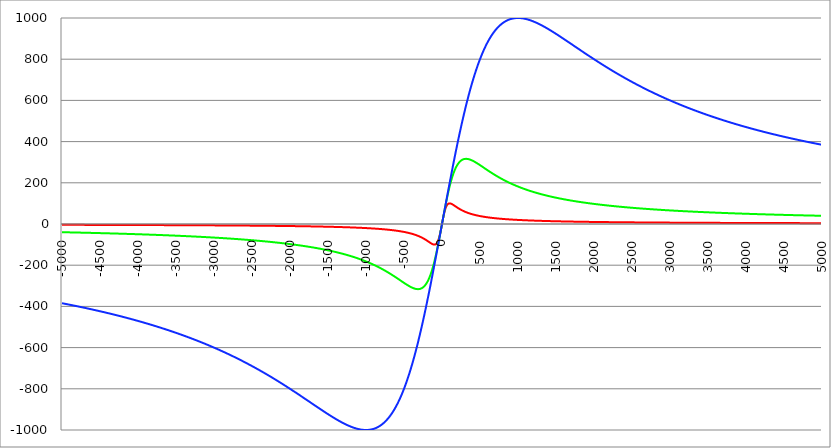
| Category | Series 1 | Series 0 | Series 2 |
|---|---|---|---|
| -5000.0 | -3.998 | -39.841 | -384.615 |
| -4995.0 | -4.002 | -39.88 | -384.971 |
| -4990.0 | -4.006 | -39.92 | -385.327 |
| -4985.0 | -4.01 | -39.96 | -385.683 |
| -4980.0 | -4.014 | -39.999 | -386.041 |
| -4975.0 | -4.018 | -40.039 | -386.398 |
| -4970.0 | -4.023 | -40.079 | -386.757 |
| -4965.0 | -4.027 | -40.119 | -387.116 |
| -4960.0 | -4.031 | -40.159 | -387.476 |
| -4955.0 | -4.035 | -40.2 | -387.836 |
| -4950.0 | -4.039 | -40.24 | -388.197 |
| -4945.0 | -4.043 | -40.28 | -388.559 |
| -4940.0 | -4.047 | -40.321 | -388.921 |
| -4935.0 | -4.051 | -40.361 | -389.284 |
| -4930.0 | -4.055 | -40.402 | -389.648 |
| -4925.0 | -4.059 | -40.442 | -390.012 |
| -4920.0 | -4.063 | -40.483 | -390.377 |
| -4915.0 | -4.067 | -40.524 | -390.743 |
| -4910.0 | -4.072 | -40.565 | -391.109 |
| -4905.0 | -4.076 | -40.606 | -391.476 |
| -4900.0 | -4.08 | -40.647 | -391.843 |
| -4895.0 | -4.084 | -40.688 | -392.211 |
| -4890.0 | -4.088 | -40.729 | -392.58 |
| -4885.0 | -4.092 | -40.771 | -392.95 |
| -4880.0 | -4.097 | -40.812 | -393.32 |
| -4875.0 | -4.101 | -40.854 | -393.691 |
| -4870.0 | -4.105 | -40.895 | -394.062 |
| -4865.0 | -4.109 | -40.937 | -394.435 |
| -4860.0 | -4.113 | -40.979 | -394.807 |
| -4855.0 | -4.118 | -41.021 | -395.181 |
| -4850.0 | -4.122 | -41.063 | -395.555 |
| -4845.0 | -4.126 | -41.105 | -395.93 |
| -4840.0 | -4.13 | -41.147 | -396.306 |
| -4835.0 | -4.135 | -41.189 | -396.682 |
| -4830.0 | -4.139 | -41.231 | -397.059 |
| -4825.0 | -4.143 | -41.273 | -397.436 |
| -4820.0 | -4.148 | -41.316 | -397.814 |
| -4815.0 | -4.152 | -41.358 | -398.193 |
| -4810.0 | -4.156 | -41.401 | -398.573 |
| -4805.0 | -4.161 | -41.444 | -398.953 |
| -4800.0 | -4.165 | -41.487 | -399.334 |
| -4795.0 | -4.169 | -41.529 | -399.716 |
| -4790.0 | -4.174 | -41.572 | -400.099 |
| -4785.0 | -4.178 | -41.616 | -400.482 |
| -4780.0 | -4.182 | -41.659 | -400.865 |
| -4775.0 | -4.187 | -41.702 | -401.25 |
| -4770.0 | -4.191 | -41.745 | -401.635 |
| -4765.0 | -4.195 | -41.789 | -402.021 |
| -4760.0 | -4.2 | -41.832 | -402.408 |
| -4755.0 | -4.204 | -41.876 | -402.795 |
| -4750.0 | -4.209 | -41.919 | -403.183 |
| -4745.0 | -4.213 | -41.963 | -403.572 |
| -4740.0 | -4.218 | -42.007 | -403.961 |
| -4735.0 | -4.222 | -42.051 | -404.351 |
| -4730.0 | -4.226 | -42.095 | -404.742 |
| -4725.0 | -4.231 | -42.139 | -405.134 |
| -4720.0 | -4.235 | -42.184 | -405.526 |
| -4715.0 | -4.24 | -42.228 | -405.919 |
| -4710.0 | -4.244 | -42.272 | -406.313 |
| -4705.0 | -4.249 | -42.317 | -406.707 |
| -4700.0 | -4.253 | -42.361 | -407.103 |
| -4695.0 | -4.258 | -42.406 | -407.499 |
| -4690.0 | -4.262 | -42.451 | -407.895 |
| -4685.0 | -4.267 | -42.496 | -408.293 |
| -4680.0 | -4.272 | -42.541 | -408.691 |
| -4675.0 | -4.276 | -42.586 | -409.09 |
| -4670.0 | -4.281 | -42.631 | -409.489 |
| -4665.0 | -4.285 | -42.676 | -409.89 |
| -4660.0 | -4.29 | -42.722 | -410.291 |
| -4655.0 | -4.294 | -42.767 | -410.693 |
| -4650.0 | -4.299 | -42.813 | -411.095 |
| -4645.0 | -4.304 | -42.858 | -411.498 |
| -4640.0 | -4.308 | -42.904 | -411.903 |
| -4635.0 | -4.313 | -42.95 | -412.307 |
| -4630.0 | -4.318 | -42.996 | -412.713 |
| -4625.0 | -4.322 | -43.042 | -413.119 |
| -4620.0 | -4.327 | -43.088 | -413.526 |
| -4615.0 | -4.332 | -43.134 | -413.934 |
| -4610.0 | -4.336 | -43.181 | -414.343 |
| -4605.0 | -4.341 | -43.227 | -414.752 |
| -4600.0 | -4.346 | -43.274 | -415.162 |
| -4595.0 | -4.35 | -43.32 | -415.573 |
| -4590.0 | -4.355 | -43.367 | -415.985 |
| -4585.0 | -4.36 | -43.414 | -416.398 |
| -4580.0 | -4.365 | -43.461 | -416.811 |
| -4575.0 | -4.369 | -43.508 | -417.225 |
| -4570.0 | -4.374 | -43.555 | -417.64 |
| -4565.0 | -4.379 | -43.602 | -418.055 |
| -4560.0 | -4.384 | -43.65 | -418.471 |
| -4555.0 | -4.389 | -43.697 | -418.889 |
| -4550.0 | -4.393 | -43.745 | -419.307 |
| -4545.0 | -4.398 | -43.792 | -419.725 |
| -4540.0 | -4.403 | -43.84 | -420.145 |
| -4535.0 | -4.408 | -43.888 | -420.565 |
| -4530.0 | -4.413 | -43.936 | -420.986 |
| -4525.0 | -4.418 | -43.984 | -421.408 |
| -4520.0 | -4.423 | -44.032 | -421.831 |
| -4515.0 | -4.428 | -44.081 | -422.254 |
| -4510.0 | -4.432 | -44.129 | -422.678 |
| -4505.0 | -4.437 | -44.177 | -423.104 |
| -4500.0 | -4.442 | -44.226 | -423.529 |
| -4495.0 | -4.447 | -44.275 | -423.956 |
| -4490.0 | -4.452 | -44.324 | -424.384 |
| -4485.0 | -4.457 | -44.372 | -424.812 |
| -4480.0 | -4.462 | -44.422 | -425.241 |
| -4475.0 | -4.467 | -44.471 | -425.671 |
| -4470.0 | -4.472 | -44.52 | -426.102 |
| -4465.0 | -4.477 | -44.569 | -426.533 |
| -4460.0 | -4.482 | -44.619 | -426.966 |
| -4455.0 | -4.487 | -44.668 | -427.399 |
| -4450.0 | -4.492 | -44.718 | -427.833 |
| -4445.0 | -4.497 | -44.768 | -428.268 |
| -4440.0 | -4.502 | -44.818 | -428.704 |
| -4435.0 | -4.507 | -44.868 | -429.14 |
| -4430.0 | -4.512 | -44.918 | -429.578 |
| -4425.0 | -4.517 | -44.968 | -430.016 |
| -4420.0 | -4.523 | -45.018 | -430.455 |
| -4415.0 | -4.528 | -45.069 | -430.895 |
| -4410.0 | -4.533 | -45.119 | -431.336 |
| -4405.0 | -4.538 | -45.17 | -431.778 |
| -4400.0 | -4.543 | -45.221 | -432.22 |
| -4395.0 | -4.548 | -45.272 | -432.663 |
| -4390.0 | -4.553 | -45.323 | -433.108 |
| -4385.0 | -4.559 | -45.374 | -433.553 |
| -4380.0 | -4.564 | -45.425 | -433.999 |
| -4375.0 | -4.569 | -45.477 | -434.445 |
| -4370.0 | -4.574 | -45.528 | -434.893 |
| -4365.0 | -4.579 | -45.58 | -435.341 |
| -4360.0 | -4.585 | -45.632 | -435.791 |
| -4355.0 | -4.59 | -45.683 | -436.241 |
| -4350.0 | -4.595 | -45.735 | -436.692 |
| -4345.0 | -4.601 | -45.787 | -437.144 |
| -4340.0 | -4.606 | -45.84 | -437.597 |
| -4335.0 | -4.611 | -45.892 | -438.051 |
| -4330.0 | -4.616 | -45.944 | -438.505 |
| -4325.0 | -4.622 | -45.997 | -438.961 |
| -4320.0 | -4.627 | -46.05 | -439.417 |
| -4315.0 | -4.633 | -46.102 | -439.875 |
| -4310.0 | -4.638 | -46.155 | -440.333 |
| -4305.0 | -4.643 | -46.208 | -440.792 |
| -4300.0 | -4.649 | -46.261 | -441.252 |
| -4295.0 | -4.654 | -46.315 | -441.713 |
| -4290.0 | -4.659 | -46.368 | -442.175 |
| -4285.0 | -4.665 | -46.422 | -442.637 |
| -4280.0 | -4.67 | -46.475 | -443.101 |
| -4275.0 | -4.676 | -46.529 | -443.565 |
| -4270.0 | -4.681 | -46.583 | -444.031 |
| -4265.0 | -4.687 | -46.637 | -444.497 |
| -4260.0 | -4.692 | -46.691 | -444.964 |
| -4255.0 | -4.698 | -46.745 | -445.433 |
| -4250.0 | -4.703 | -46.8 | -445.902 |
| -4245.0 | -4.709 | -46.854 | -446.372 |
| -4240.0 | -4.714 | -46.909 | -446.843 |
| -4235.0 | -4.72 | -46.964 | -447.314 |
| -4230.0 | -4.725 | -47.019 | -447.787 |
| -4225.0 | -4.731 | -47.074 | -448.261 |
| -4220.0 | -4.737 | -47.129 | -448.736 |
| -4215.0 | -4.742 | -47.184 | -449.211 |
| -4210.0 | -4.748 | -47.239 | -449.688 |
| -4205.0 | -4.754 | -47.295 | -450.165 |
| -4200.0 | -4.759 | -47.351 | -450.644 |
| -4195.0 | -4.765 | -47.406 | -451.123 |
| -4190.0 | -4.771 | -47.462 | -451.604 |
| -4185.0 | -4.776 | -47.518 | -452.085 |
| -4180.0 | -4.782 | -47.575 | -452.567 |
| -4175.0 | -4.788 | -47.631 | -453.05 |
| -4170.0 | -4.793 | -47.687 | -453.534 |
| -4165.0 | -4.799 | -47.744 | -454.02 |
| -4160.0 | -4.805 | -47.801 | -454.506 |
| -4155.0 | -4.811 | -47.858 | -454.993 |
| -4150.0 | -4.816 | -47.915 | -455.481 |
| -4145.0 | -4.822 | -47.972 | -455.97 |
| -4140.0 | -4.828 | -48.029 | -456.46 |
| -4135.0 | -4.834 | -48.086 | -456.951 |
| -4130.0 | -4.84 | -48.144 | -457.443 |
| -4125.0 | -4.846 | -48.202 | -457.936 |
| -4120.0 | -4.852 | -48.259 | -458.43 |
| -4115.0 | -4.857 | -48.317 | -458.925 |
| -4110.0 | -4.863 | -48.375 | -459.421 |
| -4105.0 | -4.869 | -48.434 | -459.918 |
| -4100.0 | -4.875 | -48.492 | -460.415 |
| -4095.0 | -4.881 | -48.551 | -460.914 |
| -4090.0 | -4.887 | -48.609 | -461.414 |
| -4085.0 | -4.893 | -48.668 | -461.915 |
| -4080.0 | -4.899 | -48.727 | -462.417 |
| -4075.0 | -4.905 | -48.786 | -462.92 |
| -4070.0 | -4.911 | -48.845 | -463.424 |
| -4065.0 | -4.917 | -48.905 | -463.929 |
| -4060.0 | -4.923 | -48.964 | -464.435 |
| -4055.0 | -4.929 | -49.024 | -464.942 |
| -4050.0 | -4.935 | -49.083 | -465.45 |
| -4045.0 | -4.941 | -49.143 | -465.959 |
| -4040.0 | -4.947 | -49.203 | -466.47 |
| -4035.0 | -4.954 | -49.264 | -466.981 |
| -4030.0 | -4.96 | -49.324 | -467.493 |
| -4025.0 | -4.966 | -49.385 | -468.006 |
| -4020.0 | -4.972 | -49.445 | -468.521 |
| -4015.0 | -4.978 | -49.506 | -469.036 |
| -4010.0 | -4.984 | -49.567 | -469.552 |
| -4005.0 | -4.991 | -49.628 | -470.07 |
| -4000.0 | -4.997 | -49.689 | -470.588 |
| -3995.0 | -5.003 | -49.751 | -471.108 |
| -3990.0 | -5.009 | -49.812 | -471.628 |
| -3985.0 | -5.016 | -49.874 | -472.15 |
| -3980.0 | -5.022 | -49.936 | -472.673 |
| -3975.0 | -5.028 | -49.998 | -473.197 |
| -3970.0 | -5.035 | -50.06 | -473.722 |
| -3965.0 | -5.041 | -50.123 | -474.248 |
| -3960.0 | -5.047 | -50.185 | -474.775 |
| -3955.0 | -5.054 | -50.248 | -475.303 |
| -3950.0 | -5.06 | -50.31 | -475.832 |
| -3945.0 | -5.066 | -50.373 | -476.362 |
| -3940.0 | -5.073 | -50.437 | -476.894 |
| -3935.0 | -5.079 | -50.5 | -477.426 |
| -3930.0 | -5.086 | -50.563 | -477.96 |
| -3925.0 | -5.092 | -50.627 | -478.494 |
| -3920.0 | -5.099 | -50.691 | -479.03 |
| -3915.0 | -5.105 | -50.754 | -479.567 |
| -3910.0 | -5.112 | -50.818 | -480.105 |
| -3905.0 | -5.118 | -50.883 | -480.644 |
| -3900.0 | -5.125 | -50.947 | -481.184 |
| -3895.0 | -5.131 | -51.012 | -481.726 |
| -3890.0 | -5.138 | -51.076 | -482.268 |
| -3885.0 | -5.145 | -51.141 | -482.812 |
| -3880.0 | -5.151 | -51.206 | -483.357 |
| -3875.0 | -5.158 | -51.271 | -483.902 |
| -3870.0 | -5.165 | -51.337 | -484.449 |
| -3865.0 | -5.171 | -51.402 | -484.998 |
| -3860.0 | -5.178 | -51.468 | -485.547 |
| -3855.0 | -5.185 | -51.534 | -486.097 |
| -3850.0 | -5.191 | -51.6 | -486.649 |
| -3845.0 | -5.198 | -51.666 | -487.201 |
| -3840.0 | -5.205 | -51.732 | -487.755 |
| -3835.0 | -5.212 | -51.799 | -488.31 |
| -3830.0 | -5.218 | -51.866 | -488.866 |
| -3825.0 | -5.225 | -51.933 | -489.424 |
| -3820.0 | -5.232 | -52 | -489.982 |
| -3815.0 | -5.239 | -52.067 | -490.542 |
| -3810.0 | -5.246 | -52.134 | -491.103 |
| -3805.0 | -5.253 | -52.202 | -491.665 |
| -3800.0 | -5.26 | -52.27 | -492.228 |
| -3795.0 | -5.266 | -52.338 | -492.792 |
| -3790.0 | -5.273 | -52.406 | -493.358 |
| -3785.0 | -5.28 | -52.474 | -493.925 |
| -3780.0 | -5.287 | -52.542 | -494.493 |
| -3775.0 | -5.294 | -52.611 | -495.062 |
| -3770.0 | -5.301 | -52.68 | -495.632 |
| -3765.0 | -5.308 | -52.749 | -496.204 |
| -3760.0 | -5.315 | -52.818 | -496.776 |
| -3755.0 | -5.322 | -52.887 | -497.35 |
| -3750.0 | -5.33 | -52.957 | -497.925 |
| -3745.0 | -5.337 | -53.026 | -498.502 |
| -3740.0 | -5.344 | -53.096 | -499.079 |
| -3735.0 | -5.351 | -53.166 | -499.658 |
| -3730.0 | -5.358 | -53.237 | -500.238 |
| -3725.0 | -5.365 | -53.307 | -500.819 |
| -3720.0 | -5.372 | -53.378 | -501.402 |
| -3715.0 | -5.38 | -53.449 | -501.985 |
| -3710.0 | -5.387 | -53.52 | -502.57 |
| -3705.0 | -5.394 | -53.591 | -503.157 |
| -3700.0 | -5.401 | -53.662 | -503.744 |
| -3695.0 | -5.409 | -53.734 | -504.333 |
| -3690.0 | -5.416 | -53.805 | -504.923 |
| -3685.0 | -5.423 | -53.877 | -505.514 |
| -3680.0 | -5.431 | -53.949 | -506.106 |
| -3675.0 | -5.438 | -54.022 | -506.7 |
| -3670.0 | -5.446 | -54.094 | -507.295 |
| -3665.0 | -5.453 | -54.167 | -507.891 |
| -3660.0 | -5.46 | -54.24 | -508.489 |
| -3655.0 | -5.468 | -54.313 | -509.087 |
| -3650.0 | -5.475 | -54.386 | -509.688 |
| -3645.0 | -5.483 | -54.46 | -510.289 |
| -3640.0 | -5.49 | -54.533 | -510.892 |
| -3635.0 | -5.498 | -54.607 | -511.495 |
| -3630.0 | -5.505 | -54.681 | -512.101 |
| -3625.0 | -5.513 | -54.756 | -512.707 |
| -3620.0 | -5.521 | -54.83 | -513.315 |
| -3615.0 | -5.528 | -54.905 | -513.924 |
| -3610.0 | -5.536 | -54.98 | -514.535 |
| -3605.0 | -5.544 | -55.055 | -515.146 |
| -3600.0 | -5.551 | -55.13 | -515.759 |
| -3595.0 | -5.559 | -55.206 | -516.374 |
| -3590.0 | -5.567 | -55.281 | -516.989 |
| -3585.0 | -5.574 | -55.357 | -517.606 |
| -3580.0 | -5.582 | -55.433 | -518.225 |
| -3575.0 | -5.59 | -55.51 | -518.844 |
| -3570.0 | -5.598 | -55.586 | -519.465 |
| -3565.0 | -5.606 | -55.663 | -520.088 |
| -3560.0 | -5.614 | -55.74 | -520.711 |
| -3555.0 | -5.621 | -55.817 | -521.336 |
| -3550.0 | -5.629 | -55.895 | -521.963 |
| -3545.0 | -5.637 | -55.972 | -522.591 |
| -3540.0 | -5.645 | -56.05 | -523.22 |
| -3535.0 | -5.653 | -56.128 | -523.85 |
| -3530.0 | -5.661 | -56.206 | -524.482 |
| -3525.0 | -5.669 | -56.285 | -525.115 |
| -3520.0 | -5.677 | -56.363 | -525.75 |
| -3515.0 | -5.685 | -56.442 | -526.386 |
| -3510.0 | -5.693 | -56.521 | -527.023 |
| -3505.0 | -5.701 | -56.601 | -527.662 |
| -3500.0 | -5.71 | -56.68 | -528.302 |
| -3495.0 | -5.718 | -56.76 | -528.943 |
| -3490.0 | -5.726 | -56.84 | -529.586 |
| -3485.0 | -5.734 | -56.92 | -530.231 |
| -3480.0 | -5.742 | -57.001 | -530.876 |
| -3475.0 | -5.751 | -57.081 | -531.523 |
| -3470.0 | -5.759 | -57.162 | -532.172 |
| -3465.0 | -5.767 | -57.243 | -532.822 |
| -3460.0 | -5.776 | -57.325 | -533.473 |
| -3455.0 | -5.784 | -57.406 | -534.126 |
| -3450.0 | -5.792 | -57.488 | -534.78 |
| -3445.0 | -5.801 | -57.57 | -535.436 |
| -3440.0 | -5.809 | -57.652 | -536.093 |
| -3435.0 | -5.817 | -57.735 | -536.751 |
| -3430.0 | -5.826 | -57.818 | -537.411 |
| -3425.0 | -5.834 | -57.901 | -538.073 |
| -3420.0 | -5.843 | -57.984 | -538.735 |
| -3415.0 | -5.851 | -58.067 | -539.4 |
| -3410.0 | -5.86 | -58.151 | -540.065 |
| -3405.0 | -5.869 | -58.235 | -540.733 |
| -3400.0 | -5.877 | -58.319 | -541.401 |
| -3395.0 | -5.886 | -58.403 | -542.071 |
| -3390.0 | -5.895 | -58.488 | -542.743 |
| -3385.0 | -5.903 | -58.573 | -543.416 |
| -3380.0 | -5.912 | -58.658 | -544.091 |
| -3375.0 | -5.921 | -58.744 | -544.767 |
| -3370.0 | -5.929 | -58.829 | -545.444 |
| -3365.0 | -5.938 | -58.915 | -546.123 |
| -3360.0 | -5.947 | -59.001 | -546.804 |
| -3355.0 | -5.956 | -59.088 | -547.486 |
| -3350.0 | -5.965 | -59.174 | -548.169 |
| -3345.0 | -5.974 | -59.261 | -548.854 |
| -3340.0 | -5.983 | -59.348 | -549.541 |
| -3335.0 | -5.992 | -59.436 | -550.229 |
| -3330.0 | -6.001 | -59.523 | -550.919 |
| -3325.0 | -6.01 | -59.611 | -551.61 |
| -3320.0 | -6.019 | -59.699 | -552.302 |
| -3315.0 | -6.028 | -59.788 | -552.997 |
| -3310.0 | -6.037 | -59.876 | -553.692 |
| -3305.0 | -6.046 | -59.965 | -554.39 |
| -3300.0 | -6.055 | -60.055 | -555.088 |
| -3295.0 | -6.064 | -60.144 | -555.789 |
| -3290.0 | -6.073 | -60.234 | -556.491 |
| -3285.0 | -6.083 | -60.324 | -557.194 |
| -3280.0 | -6.092 | -60.414 | -557.899 |
| -3275.0 | -6.101 | -60.505 | -558.606 |
| -3270.0 | -6.11 | -60.595 | -559.314 |
| -3265.0 | -6.12 | -60.686 | -560.023 |
| -3260.0 | -6.129 | -60.778 | -560.735 |
| -3255.0 | -6.139 | -60.869 | -561.448 |
| -3250.0 | -6.148 | -60.961 | -562.162 |
| -3245.0 | -6.157 | -61.053 | -562.878 |
| -3240.0 | -6.167 | -61.146 | -563.596 |
| -3235.0 | -6.176 | -61.239 | -564.315 |
| -3230.0 | -6.186 | -61.332 | -565.036 |
| -3225.0 | -6.196 | -61.425 | -565.758 |
| -3220.0 | -6.205 | -61.518 | -566.483 |
| -3215.0 | -6.215 | -61.612 | -567.208 |
| -3210.0 | -6.224 | -61.706 | -567.936 |
| -3205.0 | -6.234 | -61.801 | -568.664 |
| -3200.0 | -6.244 | -61.896 | -569.395 |
| -3195.0 | -6.254 | -61.991 | -570.127 |
| -3190.0 | -6.263 | -62.086 | -570.861 |
| -3185.0 | -6.273 | -62.181 | -571.596 |
| -3180.0 | -6.283 | -62.277 | -572.334 |
| -3175.0 | -6.293 | -62.373 | -573.072 |
| -3170.0 | -6.303 | -62.47 | -573.813 |
| -3165.0 | -6.313 | -62.567 | -574.555 |
| -3160.0 | -6.323 | -62.664 | -575.299 |
| -3155.0 | -6.333 | -62.761 | -576.044 |
| -3150.0 | -6.343 | -62.859 | -576.791 |
| -3145.0 | -6.353 | -62.957 | -577.54 |
| -3140.0 | -6.363 | -63.055 | -578.29 |
| -3135.0 | -6.373 | -63.153 | -579.042 |
| -3130.0 | -6.383 | -63.252 | -579.796 |
| -3125.0 | -6.393 | -63.351 | -580.552 |
| -3120.0 | -6.404 | -63.451 | -581.309 |
| -3115.0 | -6.414 | -63.551 | -582.068 |
| -3110.0 | -6.424 | -63.651 | -582.828 |
| -3105.0 | -6.435 | -63.751 | -583.59 |
| -3100.0 | -6.445 | -63.852 | -584.354 |
| -3095.0 | -6.455 | -63.953 | -585.12 |
| -3090.0 | -6.466 | -64.054 | -585.888 |
| -3085.0 | -6.476 | -64.156 | -586.657 |
| -3080.0 | -6.487 | -64.258 | -587.428 |
| -3075.0 | -6.497 | -64.36 | -588.2 |
| -3070.0 | -6.508 | -64.463 | -588.974 |
| -3065.0 | -6.518 | -64.566 | -589.751 |
| -3060.0 | -6.529 | -64.669 | -590.528 |
| -3055.0 | -6.54 | -64.772 | -591.308 |
| -3050.0 | -6.55 | -64.876 | -592.089 |
| -3045.0 | -6.561 | -64.981 | -592.872 |
| -3040.0 | -6.572 | -65.085 | -593.657 |
| -3035.0 | -6.583 | -65.19 | -594.444 |
| -3030.0 | -6.593 | -65.295 | -595.232 |
| -3025.0 | -6.604 | -65.401 | -596.022 |
| -3020.0 | -6.615 | -65.507 | -596.814 |
| -3015.0 | -6.626 | -65.613 | -597.608 |
| -3010.0 | -6.637 | -65.72 | -598.404 |
| -3005.0 | -6.648 | -65.827 | -599.201 |
| -3000.0 | -6.659 | -65.934 | -600 |
| -2995.0 | -6.67 | -66.042 | -600.801 |
| -2990.0 | -6.681 | -66.15 | -601.604 |
| -2985.0 | -6.693 | -66.258 | -602.408 |
| -2980.0 | -6.704 | -66.367 | -603.214 |
| -2975.0 | -6.715 | -66.476 | -604.023 |
| -2970.0 | -6.726 | -66.585 | -604.833 |
| -2965.0 | -6.738 | -66.695 | -605.644 |
| -2960.0 | -6.749 | -66.805 | -606.458 |
| -2955.0 | -6.76 | -66.916 | -607.273 |
| -2950.0 | -6.772 | -67.026 | -608.091 |
| -2945.0 | -6.783 | -67.138 | -608.91 |
| -2940.0 | -6.795 | -67.249 | -609.731 |
| -2935.0 | -6.806 | -67.361 | -610.554 |
| -2930.0 | -6.818 | -67.473 | -611.378 |
| -2925.0 | -6.83 | -67.586 | -612.205 |
| -2920.0 | -6.841 | -67.699 | -613.033 |
| -2915.0 | -6.853 | -67.813 | -613.864 |
| -2910.0 | -6.865 | -67.926 | -614.696 |
| -2905.0 | -6.877 | -68.041 | -615.53 |
| -2900.0 | -6.888 | -68.155 | -616.366 |
| -2895.0 | -6.9 | -68.27 | -617.203 |
| -2890.0 | -6.912 | -68.385 | -618.043 |
| -2885.0 | -6.924 | -68.501 | -618.885 |
| -2880.0 | -6.936 | -68.617 | -619.728 |
| -2875.0 | -6.948 | -68.734 | -620.573 |
| -2870.0 | -6.96 | -68.851 | -621.421 |
| -2865.0 | -6.972 | -68.968 | -622.27 |
| -2860.0 | -6.984 | -69.085 | -623.121 |
| -2855.0 | -6.997 | -69.204 | -623.974 |
| -2850.0 | -7.009 | -69.322 | -624.829 |
| -2845.0 | -7.021 | -69.441 | -625.686 |
| -2840.0 | -7.034 | -69.56 | -626.544 |
| -2835.0 | -7.046 | -69.68 | -627.405 |
| -2830.0 | -7.058 | -69.8 | -628.268 |
| -2825.0 | -7.071 | -69.92 | -629.132 |
| -2820.0 | -7.083 | -70.041 | -629.999 |
| -2815.0 | -7.096 | -70.163 | -630.867 |
| -2810.0 | -7.108 | -70.284 | -631.738 |
| -2805.0 | -7.121 | -70.406 | -632.61 |
| -2800.0 | -7.134 | -70.529 | -633.484 |
| -2795.0 | -7.146 | -70.652 | -634.36 |
| -2790.0 | -7.159 | -70.775 | -635.239 |
| -2785.0 | -7.172 | -70.899 | -636.119 |
| -2780.0 | -7.185 | -71.023 | -637.001 |
| -2775.0 | -7.198 | -71.148 | -637.885 |
| -2770.0 | -7.211 | -71.273 | -638.771 |
| -2765.0 | -7.224 | -71.399 | -639.659 |
| -2760.0 | -7.237 | -71.525 | -640.55 |
| -2755.0 | -7.25 | -71.651 | -641.442 |
| -2750.0 | -7.263 | -71.778 | -642.336 |
| -2745.0 | -7.276 | -71.905 | -643.232 |
| -2740.0 | -7.29 | -72.033 | -644.13 |
| -2735.0 | -7.303 | -72.161 | -645.03 |
| -2730.0 | -7.316 | -72.29 | -645.932 |
| -2725.0 | -7.33 | -72.419 | -646.836 |
| -2720.0 | -7.343 | -72.549 | -647.742 |
| -2715.0 | -7.357 | -72.679 | -648.651 |
| -2710.0 | -7.37 | -72.809 | -649.561 |
| -2705.0 | -7.384 | -72.94 | -650.473 |
| -2700.0 | -7.397 | -73.072 | -651.387 |
| -2695.0 | -7.411 | -73.204 | -652.303 |
| -2690.0 | -7.425 | -73.336 | -653.222 |
| -2685.0 | -7.438 | -73.469 | -654.142 |
| -2680.0 | -7.452 | -73.602 | -655.065 |
| -2675.0 | -7.466 | -73.736 | -655.989 |
| -2670.0 | -7.48 | -73.87 | -656.915 |
| -2665.0 | -7.494 | -74.005 | -657.844 |
| -2660.0 | -7.508 | -74.14 | -658.775 |
| -2655.0 | -7.522 | -74.276 | -659.707 |
| -2650.0 | -7.536 | -74.412 | -660.642 |
| -2645.0 | -7.551 | -74.549 | -661.579 |
| -2640.0 | -7.565 | -74.686 | -662.518 |
| -2635.0 | -7.579 | -74.824 | -663.458 |
| -2630.0 | -7.594 | -74.962 | -664.401 |
| -2625.0 | -7.608 | -75.101 | -665.347 |
| -2620.0 | -7.622 | -75.24 | -666.294 |
| -2615.0 | -7.637 | -75.38 | -667.243 |
| -2610.0 | -7.652 | -75.52 | -668.194 |
| -2605.0 | -7.666 | -75.66 | -669.148 |
| -2600.0 | -7.681 | -75.802 | -670.103 |
| -2595.0 | -7.696 | -75.944 | -671.061 |
| -2590.0 | -7.711 | -76.086 | -672.02 |
| -2585.0 | -7.725 | -76.229 | -672.982 |
| -2580.0 | -7.74 | -76.372 | -673.946 |
| -2575.0 | -7.755 | -76.516 | -674.912 |
| -2570.0 | -7.77 | -76.66 | -675.88 |
| -2565.0 | -7.785 | -76.805 | -676.85 |
| -2560.0 | -7.801 | -76.951 | -677.822 |
| -2555.0 | -7.816 | -77.097 | -678.797 |
| -2550.0 | -7.831 | -77.243 | -679.773 |
| -2545.0 | -7.846 | -77.391 | -680.752 |
| -2540.0 | -7.862 | -77.538 | -681.733 |
| -2535.0 | -7.877 | -77.687 | -682.716 |
| -2530.0 | -7.893 | -77.835 | -683.701 |
| -2525.0 | -7.908 | -77.985 | -684.688 |
| -2520.0 | -7.924 | -78.135 | -685.677 |
| -2515.0 | -7.94 | -78.285 | -686.668 |
| -2510.0 | -7.955 | -78.436 | -687.662 |
| -2505.0 | -7.971 | -78.588 | -688.657 |
| -2500.0 | -7.987 | -78.74 | -689.655 |
| -2495.0 | -8.003 | -78.893 | -690.655 |
| -2490.0 | -8.019 | -79.046 | -691.657 |
| -2485.0 | -8.035 | -79.2 | -692.661 |
| -2480.0 | -8.051 | -79.355 | -693.667 |
| -2475.0 | -8.068 | -79.51 | -694.676 |
| -2470.0 | -8.084 | -79.666 | -695.686 |
| -2465.0 | -8.1 | -79.822 | -696.699 |
| -2460.0 | -8.117 | -79.979 | -697.714 |
| -2455.0 | -8.133 | -80.137 | -698.731 |
| -2450.0 | -8.15 | -80.295 | -699.75 |
| -2445.0 | -8.166 | -80.454 | -700.771 |
| -2440.0 | -8.183 | -80.613 | -701.795 |
| -2435.0 | -8.2 | -80.773 | -702.82 |
| -2430.0 | -8.217 | -80.934 | -703.848 |
| -2425.0 | -8.233 | -81.095 | -704.878 |
| -2420.0 | -8.25 | -81.257 | -705.91 |
| -2415.0 | -8.267 | -81.42 | -706.944 |
| -2410.0 | -8.284 | -81.583 | -707.98 |
| -2405.0 | -8.302 | -81.747 | -709.019 |
| -2400.0 | -8.319 | -81.911 | -710.059 |
| -2395.0 | -8.336 | -82.076 | -711.102 |
| -2390.0 | -8.354 | -82.242 | -712.147 |
| -2385.0 | -8.371 | -82.409 | -713.194 |
| -2380.0 | -8.389 | -82.576 | -714.243 |
| -2375.0 | -8.406 | -82.744 | -715.294 |
| -2370.0 | -8.424 | -82.912 | -716.348 |
| -2365.0 | -8.442 | -83.081 | -717.403 |
| -2360.0 | -8.459 | -83.251 | -718.461 |
| -2355.0 | -8.477 | -83.422 | -719.521 |
| -2350.0 | -8.495 | -83.593 | -720.583 |
| -2345.0 | -8.513 | -83.765 | -721.647 |
| -2340.0 | -8.531 | -83.937 | -722.713 |
| -2335.0 | -8.55 | -84.11 | -723.781 |
| -2330.0 | -8.568 | -84.284 | -724.852 |
| -2325.0 | -8.586 | -84.459 | -725.924 |
| -2320.0 | -8.605 | -84.634 | -726.999 |
| -2315.0 | -8.623 | -84.811 | -728.076 |
| -2310.0 | -8.642 | -84.987 | -729.155 |
| -2305.0 | -8.66 | -85.165 | -730.236 |
| -2300.0 | -8.679 | -85.343 | -731.32 |
| -2295.0 | -8.698 | -85.522 | -732.405 |
| -2290.0 | -8.717 | -85.702 | -733.492 |
| -2285.0 | -8.736 | -85.882 | -734.582 |
| -2280.0 | -8.755 | -86.064 | -735.674 |
| -2275.0 | -8.774 | -86.246 | -736.768 |
| -2270.0 | -8.794 | -86.428 | -737.863 |
| -2265.0 | -8.813 | -86.612 | -738.961 |
| -2260.0 | -8.832 | -86.796 | -740.062 |
| -2255.0 | -8.852 | -86.981 | -741.164 |
| -2250.0 | -8.871 | -87.167 | -742.268 |
| -2245.0 | -8.891 | -87.354 | -743.374 |
| -2240.0 | -8.911 | -87.541 | -744.483 |
| -2235.0 | -8.931 | -87.729 | -745.593 |
| -2230.0 | -8.951 | -87.918 | -746.706 |
| -2225.0 | -8.971 | -88.108 | -747.821 |
| -2220.0 | -8.991 | -88.298 | -748.937 |
| -2215.0 | -9.011 | -88.49 | -750.056 |
| -2210.0 | -9.031 | -88.682 | -751.177 |
| -2205.0 | -9.052 | -88.875 | -752.3 |
| -2200.0 | -9.072 | -89.069 | -753.425 |
| -2195.0 | -9.093 | -89.263 | -754.552 |
| -2190.0 | -9.113 | -89.459 | -755.681 |
| -2185.0 | -9.134 | -89.655 | -756.812 |
| -2180.0 | -9.155 | -89.852 | -757.945 |
| -2175.0 | -9.176 | -90.05 | -759.08 |
| -2170.0 | -9.197 | -90.249 | -760.217 |
| -2165.0 | -9.218 | -90.449 | -761.355 |
| -2160.0 | -9.239 | -90.65 | -762.496 |
| -2155.0 | -9.261 | -90.851 | -763.639 |
| -2150.0 | -9.282 | -91.053 | -764.784 |
| -2145.0 | -9.304 | -91.257 | -765.931 |
| -2140.0 | -9.325 | -91.461 | -767.08 |
| -2135.0 | -9.347 | -91.666 | -768.231 |
| -2130.0 | -9.369 | -91.872 | -769.384 |
| -2125.0 | -9.391 | -92.079 | -770.538 |
| -2120.0 | -9.413 | -92.286 | -771.695 |
| -2115.0 | -9.435 | -92.495 | -772.853 |
| -2110.0 | -9.457 | -92.704 | -774.014 |
| -2105.0 | -9.48 | -92.915 | -775.176 |
| -2100.0 | -9.502 | -93.126 | -776.34 |
| -2095.0 | -9.525 | -93.339 | -777.506 |
| -2090.0 | -9.548 | -93.552 | -778.674 |
| -2085.0 | -9.57 | -93.766 | -779.844 |
| -2080.0 | -9.593 | -93.982 | -781.015 |
| -2075.0 | -9.616 | -94.198 | -782.189 |
| -2070.0 | -9.639 | -94.415 | -783.364 |
| -2065.0 | -9.663 | -94.633 | -784.541 |
| -2060.0 | -9.686 | -94.852 | -785.72 |
| -2055.0 | -9.709 | -95.072 | -786.9 |
| -2050.0 | -9.733 | -95.293 | -788.083 |
| -2045.0 | -9.757 | -95.516 | -789.267 |
| -2040.0 | -9.78 | -95.739 | -790.453 |
| -2035.0 | -9.804 | -95.963 | -791.64 |
| -2030.0 | -9.828 | -96.188 | -792.829 |
| -2025.0 | -9.853 | -96.414 | -794.02 |
| -2020.0 | -9.877 | -96.641 | -795.213 |
| -2015.0 | -9.901 | -96.87 | -796.407 |
| -2010.0 | -9.926 | -97.099 | -797.603 |
| -2005.0 | -9.95 | -97.33 | -798.801 |
| -2000.0 | -9.975 | -97.561 | -800 |
| -1995.0 | -10 | -97.794 | -801.201 |
| -1990.0 | -10.025 | -98.027 | -802.403 |
| -1985.0 | -10.05 | -98.262 | -803.607 |
| -1980.0 | -10.075 | -98.498 | -804.813 |
| -1975.0 | -10.101 | -98.735 | -806.02 |
| -1970.0 | -10.126 | -98.973 | -807.228 |
| -1965.0 | -10.152 | -99.212 | -808.438 |
| -1960.0 | -10.178 | -99.452 | -809.65 |
| -1955.0 | -10.203 | -99.693 | -810.863 |
| -1950.0 | -10.23 | -99.936 | -812.077 |
| -1945.0 | -10.256 | -100.18 | -813.293 |
| -1940.0 | -10.282 | -100.424 | -814.51 |
| -1935.0 | -10.308 | -100.67 | -815.729 |
| -1930.0 | -10.335 | -100.918 | -816.949 |
| -1925.0 | -10.362 | -101.166 | -818.17 |
| -1920.0 | -10.388 | -101.416 | -819.392 |
| -1915.0 | -10.415 | -101.666 | -820.616 |
| -1910.0 | -10.443 | -101.918 | -821.841 |
| -1905.0 | -10.47 | -102.171 | -823.067 |
| -1900.0 | -10.497 | -102.426 | -824.295 |
| -1895.0 | -10.525 | -102.682 | -825.524 |
| -1890.0 | -10.552 | -102.938 | -826.754 |
| -1885.0 | -10.58 | -103.196 | -827.985 |
| -1880.0 | -10.608 | -103.456 | -829.217 |
| -1875.0 | -10.636 | -103.717 | -830.45 |
| -1870.0 | -10.665 | -103.978 | -831.684 |
| -1865.0 | -10.693 | -104.242 | -832.919 |
| -1860.0 | -10.722 | -104.506 | -834.156 |
| -1855.0 | -10.75 | -104.772 | -835.393 |
| -1850.0 | -10.779 | -105.039 | -836.631 |
| -1845.0 | -10.808 | -105.307 | -837.87 |
| -1840.0 | -10.838 | -105.577 | -839.11 |
| -1835.0 | -10.867 | -105.848 | -840.351 |
| -1830.0 | -10.896 | -106.121 | -841.592 |
| -1825.0 | -10.926 | -106.395 | -842.834 |
| -1820.0 | -10.956 | -106.67 | -844.078 |
| -1815.0 | -10.986 | -106.946 | -845.321 |
| -1810.0 | -11.016 | -107.224 | -846.566 |
| -1805.0 | -11.046 | -107.504 | -847.811 |
| -1800.0 | -11.077 | -107.784 | -849.057 |
| -1795.0 | -11.108 | -108.067 | -850.303 |
| -1790.0 | -11.138 | -108.35 | -851.55 |
| -1785.0 | -11.169 | -108.635 | -852.797 |
| -1780.0 | -11.201 | -108.922 | -854.045 |
| -1775.0 | -11.232 | -109.21 | -855.293 |
| -1770.0 | -11.263 | -109.499 | -856.541 |
| -1765.0 | -11.295 | -109.79 | -857.79 |
| -1760.0 | -11.327 | -110.083 | -859.039 |
| -1755.0 | -11.359 | -110.376 | -860.289 |
| -1750.0 | -11.391 | -110.672 | -861.538 |
| -1745.0 | -11.424 | -110.969 | -862.788 |
| -1740.0 | -11.456 | -111.267 | -864.038 |
| -1735.0 | -11.489 | -111.567 | -865.288 |
| -1730.0 | -11.522 | -111.869 | -866.538 |
| -1725.0 | -11.555 | -112.172 | -867.788 |
| -1720.0 | -11.589 | -112.477 | -869.038 |
| -1715.0 | -11.622 | -112.784 | -870.288 |
| -1710.0 | -11.656 | -113.091 | -871.537 |
| -1705.0 | -11.69 | -113.401 | -872.787 |
| -1700.0 | -11.724 | -113.712 | -874.036 |
| -1695.0 | -11.758 | -114.025 | -875.285 |
| -1690.0 | -11.793 | -114.34 | -876.533 |
| -1685.0 | -11.828 | -114.656 | -877.781 |
| -1680.0 | -11.863 | -114.974 | -879.029 |
| -1675.0 | -11.898 | -115.294 | -880.276 |
| -1670.0 | -11.933 | -115.615 | -881.522 |
| -1665.0 | -11.969 | -115.938 | -882.768 |
| -1660.0 | -12.005 | -116.263 | -884.013 |
| -1655.0 | -12.041 | -116.589 | -885.258 |
| -1650.0 | -12.077 | -116.918 | -886.501 |
| -1645.0 | -12.113 | -117.248 | -887.744 |
| -1640.0 | -12.15 | -117.58 | -888.985 |
| -1635.0 | -12.187 | -117.913 | -890.226 |
| -1630.0 | -12.224 | -118.249 | -891.465 |
| -1625.0 | -12.261 | -118.586 | -892.704 |
| -1620.0 | -12.299 | -118.925 | -893.941 |
| -1615.0 | -12.337 | -119.266 | -895.177 |
| -1610.0 | -12.375 | -119.609 | -896.412 |
| -1605.0 | -12.413 | -119.954 | -897.645 |
| -1600.0 | -12.451 | -120.301 | -898.876 |
| -1595.0 | -12.49 | -120.649 | -900.107 |
| -1590.0 | -12.529 | -121 | -901.335 |
| -1585.0 | -12.568 | -121.352 | -902.562 |
| -1580.0 | -12.608 | -121.707 | -903.787 |
| -1575.0 | -12.647 | -122.063 | -905.01 |
| -1570.0 | -12.687 | -122.422 | -906.231 |
| -1565.0 | -12.728 | -122.782 | -907.45 |
| -1560.0 | -12.768 | -123.145 | -908.667 |
| -1555.0 | -12.809 | -123.509 | -909.882 |
| -1550.0 | -12.85 | -123.876 | -911.095 |
| -1545.0 | -12.891 | -124.245 | -912.305 |
| -1540.0 | -12.932 | -124.616 | -913.513 |
| -1535.0 | -12.974 | -124.989 | -914.718 |
| -1530.0 | -13.016 | -125.364 | -915.921 |
| -1525.0 | -13.059 | -125.741 | -917.121 |
| -1520.0 | -13.101 | -126.12 | -918.318 |
| -1515.0 | -13.144 | -126.502 | -919.512 |
| -1510.0 | -13.187 | -126.885 | -920.704 |
| -1505.0 | -13.231 | -127.271 | -921.892 |
| -1500.0 | -13.274 | -127.66 | -923.077 |
| -1495.0 | -13.318 | -128.05 | -924.259 |
| -1490.0 | -13.363 | -128.443 | -925.437 |
| -1485.0 | -13.407 | -128.838 | -926.612 |
| -1480.0 | -13.452 | -129.235 | -927.783 |
| -1475.0 | -13.497 | -129.635 | -928.951 |
| -1470.0 | -13.543 | -130.037 | -930.115 |
| -1465.0 | -13.589 | -130.441 | -931.275 |
| -1460.0 | -13.635 | -130.848 | -932.431 |
| -1455.0 | -13.681 | -131.257 | -933.583 |
| -1450.0 | -13.728 | -131.669 | -934.73 |
| -1445.0 | -13.775 | -132.083 | -935.873 |
| -1440.0 | -13.822 | -132.499 | -937.012 |
| -1435.0 | -13.87 | -132.918 | -938.146 |
| -1430.0 | -13.918 | -133.34 | -939.276 |
| -1425.0 | -13.966 | -133.764 | -940.4 |
| -1420.0 | -14.015 | -134.19 | -941.52 |
| -1415.0 | -14.064 | -134.619 | -942.634 |
| -1410.0 | -14.113 | -135.051 | -943.744 |
| -1405.0 | -14.163 | -135.485 | -944.847 |
| -1400.0 | -14.213 | -135.922 | -945.946 |
| -1395.0 | -14.264 | -136.362 | -947.039 |
| -1390.0 | -14.314 | -136.804 | -948.126 |
| -1385.0 | -14.366 | -137.249 | -949.207 |
| -1380.0 | -14.417 | -137.697 | -950.282 |
| -1375.0 | -14.469 | -138.148 | -951.351 |
| -1370.0 | -14.521 | -138.601 | -952.414 |
| -1365.0 | -14.574 | -139.057 | -953.47 |
| -1360.0 | -14.627 | -139.516 | -954.52 |
| -1355.0 | -14.68 | -139.978 | -955.563 |
| -1350.0 | -14.734 | -140.442 | -956.599 |
| -1345.0 | -14.788 | -140.91 | -957.628 |
| -1340.0 | -14.843 | -141.38 | -958.649 |
| -1335.0 | -14.898 | -141.853 | -959.664 |
| -1330.0 | -14.953 | -142.33 | -960.67 |
| -1325.0 | -15.009 | -142.809 | -961.669 |
| -1320.0 | -15.065 | -143.291 | -962.66 |
| -1315.0 | -15.122 | -143.777 | -963.644 |
| -1310.0 | -15.179 | -144.265 | -964.618 |
| -1305.0 | -15.236 | -144.757 | -965.585 |
| -1300.0 | -15.294 | -145.251 | -966.543 |
| -1295.0 | -15.352 | -145.749 | -967.492 |
| -1290.0 | -15.411 | -146.25 | -968.432 |
| -1285.0 | -15.471 | -146.754 | -969.363 |
| -1280.0 | -15.53 | -147.262 | -970.285 |
| -1275.0 | -15.59 | -147.773 | -971.197 |
| -1270.0 | -15.651 | -148.287 | -972.1 |
| -1265.0 | -15.712 | -148.804 | -972.993 |
| -1260.0 | -15.774 | -149.324 | -973.875 |
| -1255.0 | -15.836 | -149.849 | -974.748 |
| -1250.0 | -15.898 | -150.376 | -975.61 |
| -1245.0 | -15.961 | -150.907 | -976.461 |
| -1240.0 | -16.025 | -151.441 | -977.301 |
| -1235.0 | -16.089 | -151.979 | -978.131 |
| -1230.0 | -16.153 | -152.52 | -978.949 |
| -1225.0 | -16.218 | -153.065 | -979.755 |
| -1220.0 | -16.284 | -153.614 | -980.55 |
| -1215.0 | -16.35 | -154.166 | -981.332 |
| -1210.0 | -16.417 | -154.722 | -982.103 |
| -1205.0 | -16.484 | -155.281 | -982.861 |
| -1200.0 | -16.552 | -155.844 | -983.607 |
| -1195.0 | -16.62 | -156.411 | -984.339 |
| -1190.0 | -16.689 | -156.982 | -985.059 |
| -1185.0 | -16.758 | -157.556 | -985.765 |
| -1180.0 | -16.828 | -158.135 | -986.457 |
| -1175.0 | -16.899 | -158.717 | -987.136 |
| -1170.0 | -16.97 | -159.303 | -987.8 |
| -1165.0 | -17.042 | -159.893 | -988.45 |
| -1160.0 | -17.114 | -160.487 | -989.086 |
| -1155.0 | -17.187 | -161.085 | -989.707 |
| -1150.0 | -17.261 | -161.687 | -990.312 |
| -1145.0 | -17.335 | -162.293 | -990.902 |
| -1140.0 | -17.41 | -162.904 | -991.477 |
| -1135.0 | -17.485 | -163.518 | -992.035 |
| -1130.0 | -17.562 | -164.137 | -992.578 |
| -1125.0 | -17.638 | -164.76 | -993.103 |
| -1120.0 | -17.716 | -165.387 | -993.612 |
| -1115.0 | -17.794 | -166.018 | -994.104 |
| -1110.0 | -17.873 | -166.654 | -994.579 |
| -1105.0 | -17.953 | -167.294 | -995.036 |
| -1100.0 | -18.033 | -167.939 | -995.475 |
| -1095.0 | -18.114 | -168.588 | -995.896 |
| -1090.0 | -18.195 | -169.242 | -996.298 |
| -1085.0 | -18.278 | -169.9 | -996.682 |
| -1080.0 | -18.361 | -170.562 | -997.046 |
| -1075.0 | -18.445 | -171.229 | -997.391 |
| -1070.0 | -18.53 | -171.901 | -997.716 |
| -1065.0 | -18.615 | -172.578 | -998.02 |
| -1060.0 | -18.701 | -173.259 | -998.305 |
| -1055.0 | -18.789 | -173.945 | -998.568 |
| -1050.0 | -18.876 | -174.636 | -998.811 |
| -1045.0 | -18.965 | -175.332 | -999.032 |
| -1040.0 | -19.055 | -176.032 | -999.231 |
| -1035.0 | -19.145 | -176.738 | -999.409 |
| -1030.0 | -19.236 | -177.449 | -999.563 |
| -1025.0 | -19.328 | -178.164 | -999.695 |
| -1020.0 | -19.421 | -178.885 | -999.804 |
| -1015.0 | -19.515 | -179.61 | -999.889 |
| -1010.0 | -19.61 | -180.341 | -999.95 |
| -1005.0 | -19.705 | -181.077 | -999.988 |
| -1000.0 | -19.802 | -181.818 | -1000 |
| -995.0 | -19.9 | -182.565 | -999.987 |
| -990.0 | -19.998 | -183.316 | -999.949 |
| -985.0 | -20.097 | -184.073 | -999.886 |
| -980.0 | -20.198 | -184.836 | -999.796 |
| -975.0 | -20.299 | -185.604 | -999.68 |
| -970.0 | -20.402 | -186.377 | -999.536 |
| -965.0 | -20.505 | -187.156 | -999.366 |
| -960.0 | -20.61 | -187.94 | -999.167 |
| -955.0 | -20.715 | -188.731 | -998.941 |
| -950.0 | -20.822 | -189.526 | -998.686 |
| -945.0 | -20.93 | -190.328 | -998.402 |
| -940.0 | -21.038 | -191.135 | -998.089 |
| -935.0 | -21.148 | -191.947 | -997.746 |
| -930.0 | -21.26 | -192.766 | -997.373 |
| -925.0 | -21.372 | -193.591 | -996.969 |
| -920.0 | -21.485 | -194.421 | -996.534 |
| -915.0 | -21.6 | -195.257 | -996.067 |
| -910.0 | -21.716 | -196.1 | -995.569 |
| -905.0 | -21.833 | -196.948 | -995.039 |
| -900.0 | -21.951 | -197.802 | -994.475 |
| -895.0 | -22.071 | -198.663 | -993.878 |
| -890.0 | -22.192 | -199.529 | -993.248 |
| -885.0 | -22.314 | -200.402 | -992.584 |
| -880.0 | -22.438 | -201.281 | -991.885 |
| -875.0 | -22.562 | -202.166 | -991.15 |
| -870.0 | -22.689 | -203.058 | -990.381 |
| -865.0 | -22.816 | -203.955 | -989.575 |
| -860.0 | -22.946 | -204.859 | -988.733 |
| -855.0 | -23.076 | -205.77 | -987.854 |
| -850.0 | -23.208 | -206.687 | -986.938 |
| -845.0 | -23.342 | -207.61 | -985.983 |
| -840.0 | -23.477 | -208.54 | -984.991 |
| -835.0 | -23.613 | -209.477 | -983.959 |
| -830.0 | -23.752 | -210.42 | -982.888 |
| -825.0 | -23.891 | -211.369 | -981.778 |
| -820.0 | -24.033 | -212.325 | -980.627 |
| -815.0 | -24.176 | -213.288 | -979.435 |
| -810.0 | -24.321 | -214.257 | -978.202 |
| -805.0 | -24.467 | -215.233 | -976.927 |
| -800.0 | -24.615 | -216.216 | -975.61 |
| -795.0 | -24.765 | -217.206 | -974.25 |
| -790.0 | -24.917 | -218.202 | -972.846 |
| -785.0 | -25.071 | -219.205 | -971.399 |
| -780.0 | -25.226 | -220.215 | -969.908 |
| -775.0 | -25.384 | -221.231 | -968.372 |
| -770.0 | -25.543 | -222.254 | -966.79 |
| -765.0 | -25.705 | -223.284 | -965.163 |
| -760.0 | -25.868 | -224.321 | -963.489 |
| -755.0 | -26.033 | -225.365 | -961.768 |
| -750.0 | -26.201 | -226.415 | -960 |
| -745.0 | -26.371 | -227.472 | -958.184 |
| -740.0 | -26.542 | -228.536 | -956.319 |
| -735.0 | -26.716 | -229.607 | -954.406 |
| -730.0 | -26.893 | -230.684 | -952.443 |
| -725.0 | -27.071 | -231.768 | -950.43 |
| -720.0 | -27.252 | -232.859 | -948.367 |
| -715.0 | -27.435 | -233.956 | -946.252 |
| -710.0 | -27.621 | -235.06 | -944.086 |
| -705.0 | -27.809 | -236.171 | -941.868 |
| -700.0 | -28 | -237.288 | -939.597 |
| -695.0 | -28.193 | -238.412 | -937.273 |
| -690.0 | -28.389 | -239.542 | -934.896 |
| -685.0 | -28.588 | -240.678 | -932.464 |
| -680.0 | -28.789 | -241.821 | -929.978 |
| -675.0 | -28.993 | -242.97 | -927.437 |
| -670.0 | -29.2 | -244.125 | -924.84 |
| -665.0 | -29.41 | -245.286 | -922.186 |
| -660.0 | -29.623 | -246.453 | -919.476 |
| -655.0 | -29.839 | -247.625 | -916.709 |
| -650.0 | -30.058 | -248.804 | -913.884 |
| -645.0 | -30.28 | -249.988 | -911.001 |
| -640.0 | -30.505 | -251.177 | -908.059 |
| -635.0 | -30.734 | -252.372 | -905.058 |
| -630.0 | -30.966 | -253.572 | -901.997 |
| -625.0 | -31.201 | -254.777 | -898.876 |
| -620.0 | -31.44 | -255.987 | -895.695 |
| -615.0 | -31.683 | -257.201 | -892.452 |
| -610.0 | -31.929 | -258.42 | -889.148 |
| -605.0 | -32.179 | -259.643 | -885.782 |
| -600.0 | -32.432 | -260.87 | -882.353 |
| -595.0 | -32.69 | -262.1 | -878.861 |
| -590.0 | -32.952 | -263.334 | -875.306 |
| -585.0 | -33.217 | -264.571 | -871.687 |
| -580.0 | -33.487 | -265.811 | -868.004 |
| -575.0 | -33.761 | -267.054 | -864.256 |
| -570.0 | -34.04 | -268.298 | -860.442 |
| -565.0 | -34.323 | -269.545 | -856.564 |
| -560.0 | -34.611 | -270.793 | -852.619 |
| -555.0 | -34.903 | -272.042 | -848.608 |
| -550.0 | -35.2 | -273.292 | -844.53 |
| -545.0 | -35.502 | -274.542 | -840.385 |
| -540.0 | -35.809 | -275.792 | -836.172 |
| -535.0 | -36.121 | -277.041 | -831.892 |
| -530.0 | -36.439 | -278.288 | -827.543 |
| -525.0 | -36.761 | -279.534 | -823.126 |
| -520.0 | -37.09 | -280.778 | -818.64 |
| -515.0 | -37.424 | -282.018 | -814.084 |
| -510.0 | -37.764 | -283.255 | -809.46 |
| -505.0 | -38.11 | -284.487 | -804.765 |
| -500.0 | -38.462 | -285.714 | -800 |
| -495.0 | -38.82 | -286.936 | -795.165 |
| -490.0 | -39.184 | -288.151 | -790.259 |
| -485.0 | -39.556 | -289.358 | -785.282 |
| -480.0 | -39.933 | -290.557 | -780.234 |
| -475.0 | -40.318 | -291.747 | -775.115 |
| -470.0 | -40.71 | -292.926 | -769.924 |
| -465.0 | -41.11 | -294.094 | -764.661 |
| -460.0 | -41.516 | -295.25 | -759.327 |
| -455.0 | -41.931 | -296.393 | -753.92 |
| -450.0 | -42.353 | -297.521 | -748.441 |
| -445.0 | -42.783 | -298.633 | -742.889 |
| -440.0 | -43.222 | -299.728 | -737.265 |
| -435.0 | -43.669 | -300.804 | -731.569 |
| -430.0 | -44.125 | -301.86 | -725.8 |
| -425.0 | -44.59 | -302.895 | -719.958 |
| -420.0 | -45.064 | -303.907 | -714.043 |
| -415.0 | -45.548 | -304.895 | -708.055 |
| -410.0 | -46.042 | -305.856 | -701.995 |
| -405.0 | -46.545 | -306.789 | -695.861 |
| -400.0 | -47.059 | -307.692 | -689.655 |
| -395.0 | -47.583 | -308.564 | -683.376 |
| -390.0 | -48.118 | -309.401 | -677.025 |
| -385.0 | -48.665 | -310.202 | -670.6 |
| -380.0 | -49.223 | -310.966 | -664.103 |
| -375.0 | -49.793 | -311.688 | -657.534 |
| -370.0 | -50.374 | -312.368 | -650.893 |
| -365.0 | -50.969 | -313.002 | -644.179 |
| -360.0 | -51.576 | -313.589 | -637.394 |
| -355.0 | -52.196 | -314.125 | -630.537 |
| -350.0 | -52.83 | -314.607 | -623.608 |
| -345.0 | -53.478 | -315.033 | -616.608 |
| -340.0 | -54.14 | -315.399 | -609.537 |
| -335.0 | -54.817 | -315.703 | -602.396 |
| -330.0 | -55.509 | -315.941 | -595.184 |
| -325.0 | -56.216 | -316.109 | -587.903 |
| -320.0 | -56.94 | -316.206 | -580.552 |
| -315.0 | -57.679 | -316.225 | -573.131 |
| -310.0 | -58.435 | -316.165 | -565.642 |
| -305.0 | -59.209 | -316.021 | -558.084 |
| -300.0 | -60 | -315.789 | -550.459 |
| -295.0 | -60.809 | -315.466 | -542.766 |
| -290.0 | -61.637 | -315.046 | -535.006 |
| -285.0 | -62.483 | -314.526 | -527.18 |
| -280.0 | -63.348 | -313.901 | -519.288 |
| -275.0 | -64.234 | -313.167 | -511.331 |
| -270.0 | -65.139 | -312.319 | -503.309 |
| -265.0 | -66.064 | -311.353 | -495.223 |
| -260.0 | -67.01 | -310.263 | -487.074 |
| -255.0 | -67.977 | -309.044 | -478.862 |
| -250.0 | -68.966 | -307.692 | -470.588 |
| -245.0 | -69.975 | -306.202 | -462.253 |
| -240.0 | -71.006 | -304.569 | -453.858 |
| -235.0 | -72.058 | -302.786 | -445.403 |
| -230.0 | -73.132 | -300.85 | -436.889 |
| -225.0 | -74.227 | -298.755 | -428.316 |
| -220.0 | -75.342 | -296.496 | -419.687 |
| -215.0 | -76.478 | -294.067 | -411.001 |
| -210.0 | -77.634 | -291.464 | -402.26 |
| -205.0 | -78.808 | -288.682 | -393.465 |
| -200.0 | -80 | -285.714 | -384.615 |
| -195.0 | -81.208 | -282.558 | -375.713 |
| -190.0 | -82.43 | -279.206 | -366.76 |
| -185.0 | -83.663 | -275.657 | -357.756 |
| -180.0 | -84.906 | -271.903 | -348.702 |
| -175.0 | -86.154 | -267.943 | -339.6 |
| -170.0 | -87.404 | -263.77 | -330.45 |
| -165.0 | -88.65 | -259.383 | -321.254 |
| -160.0 | -89.888 | -254.777 | -312.012 |
| -155.0 | -91.109 | -249.95 | -302.727 |
| -150.0 | -92.308 | -244.898 | -293.399 |
| -145.0 | -93.473 | -239.62 | -284.028 |
| -140.0 | -94.595 | -234.114 | -274.617 |
| -135.0 | -95.66 | -228.378 | -265.167 |
| -130.0 | -96.654 | -222.412 | -255.679 |
| -125.0 | -97.561 | -216.216 | -246.154 |
| -120.0 | -98.361 | -209.79 | -236.593 |
| -115.0 | -99.031 | -203.135 | -226.998 |
| -110.0 | -99.548 | -196.253 | -217.37 |
| -105.0 | -99.881 | -189.147 | -207.71 |
| -100.0 | -100 | -181.818 | -198.02 |
| -95.0 | -99.869 | -174.272 | -188.301 |
| -90.0 | -99.448 | -166.512 | -178.554 |
| -85.0 | -98.694 | -158.545 | -168.781 |
| -80.0 | -97.561 | -150.376 | -158.983 |
| -75.0 | -96 | -142.012 | -149.161 |
| -70.0 | -93.96 | -133.46 | -139.317 |
| -65.0 | -91.388 | -124.73 | -129.453 |
| -60.0 | -88.235 | -115.83 | -119.57 |
| -55.0 | -84.453 | -106.77 | -109.668 |
| -50.0 | -80 | -97.561 | -99.751 |
| -45.0 | -74.844 | -88.214 | -89.818 |
| -40.0 | -68.966 | -78.74 | -79.872 |
| -35.0 | -62.361 | -69.153 | -69.914 |
| -30.0 | -55.046 | -59.465 | -59.946 |
| -25.0 | -47.059 | -49.689 | -49.969 |
| -20.0 | -38.462 | -39.841 | -39.984 |
| -15.0 | -29.34 | -29.933 | -29.993 |
| -10.0 | -19.802 | -19.98 | -19.998 |
| -5.0 | -9.975 | -9.998 | -10 |
| 0.0 | 0 | 0 | 0 |
| 5.0 | 9.975 | 9.998 | 10 |
| 10.0 | 19.802 | 19.98 | 19.998 |
| 15.0 | 29.34 | 29.933 | 29.993 |
| 20.0 | 38.462 | 39.841 | 39.984 |
| 25.0 | 47.059 | 49.689 | 49.969 |
| 30.0 | 55.046 | 59.465 | 59.946 |
| 35.0 | 62.361 | 69.153 | 69.914 |
| 40.0 | 68.966 | 78.74 | 79.872 |
| 45.0 | 74.844 | 88.214 | 89.818 |
| 50.0 | 80 | 97.561 | 99.751 |
| 55.0 | 84.453 | 106.77 | 109.668 |
| 60.0 | 88.235 | 115.83 | 119.57 |
| 65.0 | 91.388 | 124.73 | 129.453 |
| 70.0 | 93.96 | 133.46 | 139.317 |
| 75.0 | 96 | 142.012 | 149.161 |
| 80.0 | 97.561 | 150.376 | 158.983 |
| 85.0 | 98.694 | 158.545 | 168.781 |
| 90.0 | 99.448 | 166.512 | 178.554 |
| 95.0 | 99.869 | 174.272 | 188.301 |
| 100.0 | 100 | 181.818 | 198.02 |
| 105.0 | 99.881 | 189.147 | 207.71 |
| 110.0 | 99.548 | 196.253 | 217.37 |
| 115.0 | 99.031 | 203.135 | 226.998 |
| 120.0 | 98.361 | 209.79 | 236.593 |
| 125.0 | 97.561 | 216.216 | 246.154 |
| 130.0 | 96.654 | 222.412 | 255.679 |
| 135.0 | 95.66 | 228.378 | 265.167 |
| 140.0 | 94.595 | 234.114 | 274.617 |
| 145.0 | 93.473 | 239.62 | 284.028 |
| 150.0 | 92.308 | 244.898 | 293.399 |
| 155.0 | 91.109 | 249.95 | 302.727 |
| 160.0 | 89.888 | 254.777 | 312.012 |
| 165.0 | 88.65 | 259.383 | 321.254 |
| 170.0 | 87.404 | 263.77 | 330.45 |
| 175.0 | 86.154 | 267.943 | 339.6 |
| 180.0 | 84.906 | 271.903 | 348.702 |
| 185.0 | 83.663 | 275.657 | 357.756 |
| 190.0 | 82.43 | 279.206 | 366.76 |
| 195.0 | 81.208 | 282.558 | 375.713 |
| 200.0 | 80 | 285.714 | 384.615 |
| 205.0 | 78.808 | 288.682 | 393.465 |
| 210.0 | 77.634 | 291.464 | 402.26 |
| 215.0 | 76.478 | 294.067 | 411.001 |
| 220.0 | 75.342 | 296.496 | 419.687 |
| 225.0 | 74.227 | 298.755 | 428.316 |
| 230.0 | 73.132 | 300.85 | 436.889 |
| 235.0 | 72.058 | 302.786 | 445.403 |
| 240.0 | 71.006 | 304.569 | 453.858 |
| 245.0 | 69.975 | 306.202 | 462.253 |
| 250.0 | 68.966 | 307.692 | 470.588 |
| 255.0 | 67.977 | 309.044 | 478.862 |
| 260.0 | 67.01 | 310.263 | 487.074 |
| 265.0 | 66.064 | 311.353 | 495.223 |
| 270.0 | 65.139 | 312.319 | 503.309 |
| 275.0 | 64.234 | 313.167 | 511.331 |
| 280.0 | 63.348 | 313.901 | 519.288 |
| 285.0 | 62.483 | 314.526 | 527.18 |
| 290.0 | 61.637 | 315.046 | 535.006 |
| 295.0 | 60.809 | 315.466 | 542.766 |
| 300.0 | 60 | 315.789 | 550.459 |
| 305.0 | 59.209 | 316.021 | 558.084 |
| 310.0 | 58.435 | 316.165 | 565.642 |
| 315.0 | 57.679 | 316.225 | 573.131 |
| 320.0 | 56.94 | 316.206 | 580.552 |
| 325.0 | 56.216 | 316.109 | 587.903 |
| 330.0 | 55.509 | 315.941 | 595.184 |
| 335.0 | 54.817 | 315.703 | 602.396 |
| 340.0 | 54.14 | 315.399 | 609.537 |
| 345.0 | 53.478 | 315.033 | 616.608 |
| 350.0 | 52.83 | 314.607 | 623.608 |
| 355.0 | 52.196 | 314.125 | 630.537 |
| 360.0 | 51.576 | 313.589 | 637.394 |
| 365.0 | 50.969 | 313.002 | 644.179 |
| 370.0 | 50.374 | 312.368 | 650.893 |
| 375.0 | 49.793 | 311.688 | 657.534 |
| 380.0 | 49.223 | 310.966 | 664.103 |
| 385.0 | 48.665 | 310.202 | 670.6 |
| 390.0 | 48.118 | 309.401 | 677.025 |
| 395.0 | 47.583 | 308.564 | 683.376 |
| 400.0 | 47.059 | 307.692 | 689.655 |
| 405.0 | 46.545 | 306.789 | 695.861 |
| 410.0 | 46.042 | 305.856 | 701.995 |
| 415.0 | 45.548 | 304.895 | 708.055 |
| 420.0 | 45.064 | 303.907 | 714.043 |
| 425.0 | 44.59 | 302.895 | 719.958 |
| 430.0 | 44.125 | 301.86 | 725.8 |
| 435.0 | 43.669 | 300.804 | 731.569 |
| 440.0 | 43.222 | 299.728 | 737.265 |
| 445.0 | 42.783 | 298.633 | 742.889 |
| 450.0 | 42.353 | 297.521 | 748.441 |
| 455.0 | 41.931 | 296.393 | 753.92 |
| 460.0 | 41.516 | 295.25 | 759.327 |
| 465.0 | 41.11 | 294.094 | 764.661 |
| 470.0 | 40.71 | 292.926 | 769.924 |
| 475.0 | 40.318 | 291.747 | 775.115 |
| 480.0 | 39.933 | 290.557 | 780.234 |
| 485.0 | 39.556 | 289.358 | 785.282 |
| 490.0 | 39.184 | 288.151 | 790.259 |
| 495.0 | 38.82 | 286.936 | 795.165 |
| 500.0 | 38.462 | 285.714 | 800 |
| 505.0 | 38.11 | 284.487 | 804.765 |
| 510.0 | 37.764 | 283.255 | 809.46 |
| 515.0 | 37.424 | 282.018 | 814.084 |
| 520.0 | 37.09 | 280.778 | 818.64 |
| 525.0 | 36.761 | 279.534 | 823.126 |
| 530.0 | 36.439 | 278.288 | 827.543 |
| 535.0 | 36.121 | 277.041 | 831.892 |
| 540.0 | 35.809 | 275.792 | 836.172 |
| 545.0 | 35.502 | 274.542 | 840.385 |
| 550.0 | 35.2 | 273.292 | 844.53 |
| 555.0 | 34.903 | 272.042 | 848.608 |
| 560.0 | 34.611 | 270.793 | 852.619 |
| 565.0 | 34.323 | 269.545 | 856.564 |
| 570.0 | 34.04 | 268.298 | 860.442 |
| 575.0 | 33.761 | 267.054 | 864.256 |
| 580.0 | 33.487 | 265.811 | 868.004 |
| 585.0 | 33.217 | 264.571 | 871.687 |
| 590.0 | 32.952 | 263.334 | 875.306 |
| 595.0 | 32.69 | 262.1 | 878.861 |
| 600.0 | 32.432 | 260.87 | 882.353 |
| 605.0 | 32.179 | 259.643 | 885.782 |
| 610.0 | 31.929 | 258.42 | 889.148 |
| 615.0 | 31.683 | 257.201 | 892.452 |
| 620.0 | 31.44 | 255.987 | 895.695 |
| 625.0 | 31.201 | 254.777 | 898.876 |
| 630.0 | 30.966 | 253.572 | 901.997 |
| 635.0 | 30.734 | 252.372 | 905.058 |
| 640.0 | 30.505 | 251.177 | 908.059 |
| 645.0 | 30.28 | 249.988 | 911.001 |
| 650.0 | 30.058 | 248.804 | 913.884 |
| 655.0 | 29.839 | 247.625 | 916.709 |
| 660.0 | 29.623 | 246.453 | 919.476 |
| 665.0 | 29.41 | 245.286 | 922.186 |
| 670.0 | 29.2 | 244.125 | 924.84 |
| 675.0 | 28.993 | 242.97 | 927.437 |
| 680.0 | 28.789 | 241.821 | 929.978 |
| 685.0 | 28.588 | 240.678 | 932.464 |
| 690.0 | 28.389 | 239.542 | 934.896 |
| 695.0 | 28.193 | 238.412 | 937.273 |
| 700.0 | 28 | 237.288 | 939.597 |
| 705.0 | 27.809 | 236.171 | 941.868 |
| 710.0 | 27.621 | 235.06 | 944.086 |
| 715.0 | 27.435 | 233.956 | 946.252 |
| 720.0 | 27.252 | 232.859 | 948.367 |
| 725.0 | 27.071 | 231.768 | 950.43 |
| 730.0 | 26.893 | 230.684 | 952.443 |
| 735.0 | 26.716 | 229.607 | 954.406 |
| 740.0 | 26.542 | 228.536 | 956.319 |
| 745.0 | 26.371 | 227.472 | 958.184 |
| 750.0 | 26.201 | 226.415 | 960 |
| 755.0 | 26.033 | 225.365 | 961.768 |
| 760.0 | 25.868 | 224.321 | 963.489 |
| 765.0 | 25.705 | 223.284 | 965.163 |
| 770.0 | 25.543 | 222.254 | 966.79 |
| 775.0 | 25.384 | 221.231 | 968.372 |
| 780.0 | 25.226 | 220.215 | 969.908 |
| 785.0 | 25.071 | 219.205 | 971.399 |
| 790.0 | 24.917 | 218.202 | 972.846 |
| 795.0 | 24.765 | 217.206 | 974.25 |
| 800.0 | 24.615 | 216.216 | 975.61 |
| 805.0 | 24.467 | 215.233 | 976.927 |
| 810.0 | 24.321 | 214.257 | 978.202 |
| 815.0 | 24.176 | 213.288 | 979.435 |
| 820.0 | 24.033 | 212.325 | 980.627 |
| 825.0 | 23.891 | 211.369 | 981.778 |
| 830.0 | 23.752 | 210.42 | 982.888 |
| 835.0 | 23.613 | 209.477 | 983.959 |
| 840.0 | 23.477 | 208.54 | 984.991 |
| 845.0 | 23.342 | 207.61 | 985.983 |
| 850.0 | 23.208 | 206.687 | 986.938 |
| 855.0 | 23.076 | 205.77 | 987.854 |
| 860.0 | 22.946 | 204.859 | 988.733 |
| 865.0 | 22.816 | 203.955 | 989.575 |
| 870.0 | 22.689 | 203.058 | 990.381 |
| 875.0 | 22.562 | 202.166 | 991.15 |
| 880.0 | 22.438 | 201.281 | 991.885 |
| 885.0 | 22.314 | 200.402 | 992.584 |
| 890.0 | 22.192 | 199.529 | 993.248 |
| 895.0 | 22.071 | 198.663 | 993.878 |
| 900.0 | 21.951 | 197.802 | 994.475 |
| 905.0 | 21.833 | 196.948 | 995.039 |
| 910.0 | 21.716 | 196.1 | 995.569 |
| 915.0 | 21.6 | 195.257 | 996.067 |
| 920.0 | 21.485 | 194.421 | 996.534 |
| 925.0 | 21.372 | 193.591 | 996.969 |
| 930.0 | 21.26 | 192.766 | 997.373 |
| 935.0 | 21.148 | 191.947 | 997.746 |
| 940.0 | 21.038 | 191.135 | 998.089 |
| 945.0 | 20.93 | 190.328 | 998.402 |
| 950.0 | 20.822 | 189.526 | 998.686 |
| 955.0 | 20.715 | 188.731 | 998.941 |
| 960.0 | 20.61 | 187.94 | 999.167 |
| 965.0 | 20.505 | 187.156 | 999.366 |
| 970.0 | 20.402 | 186.377 | 999.536 |
| 975.0 | 20.299 | 185.604 | 999.68 |
| 980.0 | 20.198 | 184.836 | 999.796 |
| 985.0 | 20.097 | 184.073 | 999.886 |
| 990.0 | 19.998 | 183.316 | 999.949 |
| 995.0 | 19.9 | 182.565 | 999.987 |
| 1000.0 | 19.802 | 181.818 | 1000 |
| 1005.0 | 19.705 | 181.077 | 999.988 |
| 1010.0 | 19.61 | 180.341 | 999.95 |
| 1015.0 | 19.515 | 179.61 | 999.889 |
| 1020.0 | 19.421 | 178.885 | 999.804 |
| 1025.0 | 19.328 | 178.164 | 999.695 |
| 1030.0 | 19.236 | 177.449 | 999.563 |
| 1035.0 | 19.145 | 176.738 | 999.409 |
| 1040.0 | 19.055 | 176.032 | 999.231 |
| 1045.0 | 18.965 | 175.332 | 999.032 |
| 1050.0 | 18.876 | 174.636 | 998.811 |
| 1055.0 | 18.789 | 173.945 | 998.568 |
| 1060.0 | 18.701 | 173.259 | 998.305 |
| 1065.0 | 18.615 | 172.578 | 998.02 |
| 1070.0 | 18.53 | 171.901 | 997.716 |
| 1075.0 | 18.445 | 171.229 | 997.391 |
| 1080.0 | 18.361 | 170.562 | 997.046 |
| 1085.0 | 18.278 | 169.9 | 996.682 |
| 1090.0 | 18.195 | 169.242 | 996.298 |
| 1095.0 | 18.114 | 168.588 | 995.896 |
| 1100.0 | 18.033 | 167.939 | 995.475 |
| 1105.0 | 17.953 | 167.294 | 995.036 |
| 1110.0 | 17.873 | 166.654 | 994.579 |
| 1115.0 | 17.794 | 166.018 | 994.104 |
| 1120.0 | 17.716 | 165.387 | 993.612 |
| 1125.0 | 17.638 | 164.76 | 993.103 |
| 1130.0 | 17.562 | 164.137 | 992.578 |
| 1135.0 | 17.485 | 163.518 | 992.035 |
| 1140.0 | 17.41 | 162.904 | 991.477 |
| 1145.0 | 17.335 | 162.293 | 990.902 |
| 1150.0 | 17.261 | 161.687 | 990.312 |
| 1155.0 | 17.187 | 161.085 | 989.707 |
| 1160.0 | 17.114 | 160.487 | 989.086 |
| 1165.0 | 17.042 | 159.893 | 988.45 |
| 1170.0 | 16.97 | 159.303 | 987.8 |
| 1175.0 | 16.899 | 158.717 | 987.136 |
| 1180.0 | 16.828 | 158.135 | 986.457 |
| 1185.0 | 16.758 | 157.556 | 985.765 |
| 1190.0 | 16.689 | 156.982 | 985.059 |
| 1195.0 | 16.62 | 156.411 | 984.339 |
| 1200.0 | 16.552 | 155.844 | 983.607 |
| 1205.0 | 16.484 | 155.281 | 982.861 |
| 1210.0 | 16.417 | 154.722 | 982.103 |
| 1215.0 | 16.35 | 154.166 | 981.332 |
| 1220.0 | 16.284 | 153.614 | 980.55 |
| 1225.0 | 16.218 | 153.065 | 979.755 |
| 1230.0 | 16.153 | 152.52 | 978.949 |
| 1235.0 | 16.089 | 151.979 | 978.131 |
| 1240.0 | 16.025 | 151.441 | 977.301 |
| 1245.0 | 15.961 | 150.907 | 976.461 |
| 1250.0 | 15.898 | 150.376 | 975.61 |
| 1255.0 | 15.836 | 149.849 | 974.748 |
| 1260.0 | 15.774 | 149.324 | 973.875 |
| 1265.0 | 15.712 | 148.804 | 972.993 |
| 1270.0 | 15.651 | 148.287 | 972.1 |
| 1275.0 | 15.59 | 147.773 | 971.197 |
| 1280.0 | 15.53 | 147.262 | 970.285 |
| 1285.0 | 15.471 | 146.754 | 969.363 |
| 1290.0 | 15.411 | 146.25 | 968.432 |
| 1295.0 | 15.352 | 145.749 | 967.492 |
| 1300.0 | 15.294 | 145.251 | 966.543 |
| 1305.0 | 15.236 | 144.757 | 965.585 |
| 1310.0 | 15.179 | 144.265 | 964.618 |
| 1315.0 | 15.122 | 143.777 | 963.644 |
| 1320.0 | 15.065 | 143.291 | 962.66 |
| 1325.0 | 15.009 | 142.809 | 961.669 |
| 1330.0 | 14.953 | 142.33 | 960.67 |
| 1335.0 | 14.898 | 141.853 | 959.664 |
| 1340.0 | 14.843 | 141.38 | 958.649 |
| 1345.0 | 14.788 | 140.91 | 957.628 |
| 1350.0 | 14.734 | 140.442 | 956.599 |
| 1355.0 | 14.68 | 139.978 | 955.563 |
| 1360.0 | 14.627 | 139.516 | 954.52 |
| 1365.0 | 14.574 | 139.057 | 953.47 |
| 1370.0 | 14.521 | 138.601 | 952.414 |
| 1375.0 | 14.469 | 138.148 | 951.351 |
| 1380.0 | 14.417 | 137.697 | 950.282 |
| 1385.0 | 14.366 | 137.249 | 949.207 |
| 1390.0 | 14.314 | 136.804 | 948.126 |
| 1395.0 | 14.264 | 136.362 | 947.039 |
| 1400.0 | 14.213 | 135.922 | 945.946 |
| 1405.0 | 14.163 | 135.485 | 944.847 |
| 1410.0 | 14.113 | 135.051 | 943.744 |
| 1415.0 | 14.064 | 134.619 | 942.634 |
| 1420.0 | 14.015 | 134.19 | 941.52 |
| 1425.0 | 13.966 | 133.764 | 940.4 |
| 1430.0 | 13.918 | 133.34 | 939.276 |
| 1435.0 | 13.87 | 132.918 | 938.146 |
| 1440.0 | 13.822 | 132.499 | 937.012 |
| 1445.0 | 13.775 | 132.083 | 935.873 |
| 1450.0 | 13.728 | 131.669 | 934.73 |
| 1455.0 | 13.681 | 131.257 | 933.583 |
| 1460.0 | 13.635 | 130.848 | 932.431 |
| 1465.0 | 13.589 | 130.441 | 931.275 |
| 1470.0 | 13.543 | 130.037 | 930.115 |
| 1475.0 | 13.497 | 129.635 | 928.951 |
| 1480.0 | 13.452 | 129.235 | 927.783 |
| 1485.0 | 13.407 | 128.838 | 926.612 |
| 1490.0 | 13.363 | 128.443 | 925.437 |
| 1495.0 | 13.318 | 128.05 | 924.259 |
| 1500.0 | 13.274 | 127.66 | 923.077 |
| 1505.0 | 13.231 | 127.271 | 921.892 |
| 1510.0 | 13.187 | 126.885 | 920.704 |
| 1515.0 | 13.144 | 126.502 | 919.512 |
| 1520.0 | 13.101 | 126.12 | 918.318 |
| 1525.0 | 13.059 | 125.741 | 917.121 |
| 1530.0 | 13.016 | 125.364 | 915.921 |
| 1535.0 | 12.974 | 124.989 | 914.718 |
| 1540.0 | 12.932 | 124.616 | 913.513 |
| 1545.0 | 12.891 | 124.245 | 912.305 |
| 1550.0 | 12.85 | 123.876 | 911.095 |
| 1555.0 | 12.809 | 123.509 | 909.882 |
| 1560.0 | 12.768 | 123.145 | 908.667 |
| 1565.0 | 12.728 | 122.782 | 907.45 |
| 1570.0 | 12.687 | 122.422 | 906.231 |
| 1575.0 | 12.647 | 122.063 | 905.01 |
| 1580.0 | 12.608 | 121.707 | 903.787 |
| 1585.0 | 12.568 | 121.352 | 902.562 |
| 1590.0 | 12.529 | 121 | 901.335 |
| 1595.0 | 12.49 | 120.649 | 900.107 |
| 1600.0 | 12.451 | 120.301 | 898.876 |
| 1605.0 | 12.413 | 119.954 | 897.645 |
| 1610.0 | 12.375 | 119.609 | 896.412 |
| 1615.0 | 12.337 | 119.266 | 895.177 |
| 1620.0 | 12.299 | 118.925 | 893.941 |
| 1625.0 | 12.261 | 118.586 | 892.704 |
| 1630.0 | 12.224 | 118.249 | 891.465 |
| 1635.0 | 12.187 | 117.913 | 890.226 |
| 1640.0 | 12.15 | 117.58 | 888.985 |
| 1645.0 | 12.113 | 117.248 | 887.744 |
| 1650.0 | 12.077 | 116.918 | 886.501 |
| 1655.0 | 12.041 | 116.589 | 885.258 |
| 1660.0 | 12.005 | 116.263 | 884.013 |
| 1665.0 | 11.969 | 115.938 | 882.768 |
| 1670.0 | 11.933 | 115.615 | 881.522 |
| 1675.0 | 11.898 | 115.294 | 880.276 |
| 1680.0 | 11.863 | 114.974 | 879.029 |
| 1685.0 | 11.828 | 114.656 | 877.781 |
| 1690.0 | 11.793 | 114.34 | 876.533 |
| 1695.0 | 11.758 | 114.025 | 875.285 |
| 1700.0 | 11.724 | 113.712 | 874.036 |
| 1705.0 | 11.69 | 113.401 | 872.787 |
| 1710.0 | 11.656 | 113.091 | 871.537 |
| 1715.0 | 11.622 | 112.784 | 870.288 |
| 1720.0 | 11.589 | 112.477 | 869.038 |
| 1725.0 | 11.555 | 112.172 | 867.788 |
| 1730.0 | 11.522 | 111.869 | 866.538 |
| 1735.0 | 11.489 | 111.567 | 865.288 |
| 1740.0 | 11.456 | 111.267 | 864.038 |
| 1745.0 | 11.424 | 110.969 | 862.788 |
| 1750.0 | 11.391 | 110.672 | 861.538 |
| 1755.0 | 11.359 | 110.376 | 860.289 |
| 1760.0 | 11.327 | 110.083 | 859.039 |
| 1765.0 | 11.295 | 109.79 | 857.79 |
| 1770.0 | 11.263 | 109.499 | 856.541 |
| 1775.0 | 11.232 | 109.21 | 855.293 |
| 1780.0 | 11.201 | 108.922 | 854.045 |
| 1785.0 | 11.169 | 108.635 | 852.797 |
| 1790.0 | 11.138 | 108.35 | 851.55 |
| 1795.0 | 11.108 | 108.067 | 850.303 |
| 1800.0 | 11.077 | 107.784 | 849.057 |
| 1805.0 | 11.046 | 107.504 | 847.811 |
| 1810.0 | 11.016 | 107.224 | 846.566 |
| 1815.0 | 10.986 | 106.946 | 845.321 |
| 1820.0 | 10.956 | 106.67 | 844.078 |
| 1825.0 | 10.926 | 106.395 | 842.834 |
| 1830.0 | 10.896 | 106.121 | 841.592 |
| 1835.0 | 10.867 | 105.848 | 840.351 |
| 1840.0 | 10.838 | 105.577 | 839.11 |
| 1845.0 | 10.808 | 105.307 | 837.87 |
| 1850.0 | 10.779 | 105.039 | 836.631 |
| 1855.0 | 10.75 | 104.772 | 835.393 |
| 1860.0 | 10.722 | 104.506 | 834.156 |
| 1865.0 | 10.693 | 104.242 | 832.919 |
| 1870.0 | 10.665 | 103.978 | 831.684 |
| 1875.0 | 10.636 | 103.717 | 830.45 |
| 1880.0 | 10.608 | 103.456 | 829.217 |
| 1885.0 | 10.58 | 103.196 | 827.985 |
| 1890.0 | 10.552 | 102.938 | 826.754 |
| 1895.0 | 10.525 | 102.682 | 825.524 |
| 1900.0 | 10.497 | 102.426 | 824.295 |
| 1905.0 | 10.47 | 102.171 | 823.067 |
| 1910.0 | 10.443 | 101.918 | 821.841 |
| 1915.0 | 10.415 | 101.666 | 820.616 |
| 1920.0 | 10.388 | 101.416 | 819.392 |
| 1925.0 | 10.362 | 101.166 | 818.17 |
| 1930.0 | 10.335 | 100.918 | 816.949 |
| 1935.0 | 10.308 | 100.67 | 815.729 |
| 1940.0 | 10.282 | 100.424 | 814.51 |
| 1945.0 | 10.256 | 100.18 | 813.293 |
| 1950.0 | 10.23 | 99.936 | 812.077 |
| 1955.0 | 10.203 | 99.693 | 810.863 |
| 1960.0 | 10.178 | 99.452 | 809.65 |
| 1965.0 | 10.152 | 99.212 | 808.438 |
| 1970.0 | 10.126 | 98.973 | 807.228 |
| 1975.0 | 10.101 | 98.735 | 806.02 |
| 1980.0 | 10.075 | 98.498 | 804.813 |
| 1985.0 | 10.05 | 98.262 | 803.607 |
| 1990.0 | 10.025 | 98.027 | 802.403 |
| 1995.0 | 10 | 97.794 | 801.201 |
| 2000.0 | 9.975 | 97.561 | 800 |
| 2005.0 | 9.95 | 97.33 | 798.801 |
| 2010.0 | 9.926 | 97.099 | 797.603 |
| 2015.0 | 9.901 | 96.87 | 796.407 |
| 2020.0 | 9.877 | 96.641 | 795.213 |
| 2025.0 | 9.853 | 96.414 | 794.02 |
| 2030.0 | 9.828 | 96.188 | 792.829 |
| 2035.0 | 9.804 | 95.963 | 791.64 |
| 2040.0 | 9.78 | 95.739 | 790.453 |
| 2045.0 | 9.757 | 95.516 | 789.267 |
| 2050.0 | 9.733 | 95.293 | 788.083 |
| 2055.0 | 9.709 | 95.072 | 786.9 |
| 2060.0 | 9.686 | 94.852 | 785.72 |
| 2065.0 | 9.663 | 94.633 | 784.541 |
| 2070.0 | 9.639 | 94.415 | 783.364 |
| 2075.0 | 9.616 | 94.198 | 782.189 |
| 2080.0 | 9.593 | 93.982 | 781.015 |
| 2085.0 | 9.57 | 93.766 | 779.844 |
| 2090.0 | 9.548 | 93.552 | 778.674 |
| 2095.0 | 9.525 | 93.339 | 777.506 |
| 2100.0 | 9.502 | 93.126 | 776.34 |
| 2105.0 | 9.48 | 92.915 | 775.176 |
| 2110.0 | 9.457 | 92.704 | 774.014 |
| 2115.0 | 9.435 | 92.495 | 772.853 |
| 2120.0 | 9.413 | 92.286 | 771.695 |
| 2125.0 | 9.391 | 92.079 | 770.538 |
| 2130.0 | 9.369 | 91.872 | 769.384 |
| 2135.0 | 9.347 | 91.666 | 768.231 |
| 2140.0 | 9.325 | 91.461 | 767.08 |
| 2145.0 | 9.304 | 91.257 | 765.931 |
| 2150.0 | 9.282 | 91.053 | 764.784 |
| 2155.0 | 9.261 | 90.851 | 763.639 |
| 2160.0 | 9.239 | 90.65 | 762.496 |
| 2165.0 | 9.218 | 90.449 | 761.355 |
| 2170.0 | 9.197 | 90.249 | 760.217 |
| 2175.0 | 9.176 | 90.05 | 759.08 |
| 2180.0 | 9.155 | 89.852 | 757.945 |
| 2185.0 | 9.134 | 89.655 | 756.812 |
| 2190.0 | 9.113 | 89.459 | 755.681 |
| 2195.0 | 9.093 | 89.263 | 754.552 |
| 2200.0 | 9.072 | 89.069 | 753.425 |
| 2205.0 | 9.052 | 88.875 | 752.3 |
| 2210.0 | 9.031 | 88.682 | 751.177 |
| 2215.0 | 9.011 | 88.49 | 750.056 |
| 2220.0 | 8.991 | 88.298 | 748.937 |
| 2225.0 | 8.971 | 88.108 | 747.821 |
| 2230.0 | 8.951 | 87.918 | 746.706 |
| 2235.0 | 8.931 | 87.729 | 745.593 |
| 2240.0 | 8.911 | 87.541 | 744.483 |
| 2245.0 | 8.891 | 87.354 | 743.374 |
| 2250.0 | 8.871 | 87.167 | 742.268 |
| 2255.0 | 8.852 | 86.981 | 741.164 |
| 2260.0 | 8.832 | 86.796 | 740.062 |
| 2265.0 | 8.813 | 86.612 | 738.961 |
| 2270.0 | 8.794 | 86.428 | 737.863 |
| 2275.0 | 8.774 | 86.246 | 736.768 |
| 2280.0 | 8.755 | 86.064 | 735.674 |
| 2285.0 | 8.736 | 85.882 | 734.582 |
| 2290.0 | 8.717 | 85.702 | 733.492 |
| 2295.0 | 8.698 | 85.522 | 732.405 |
| 2300.0 | 8.679 | 85.343 | 731.32 |
| 2305.0 | 8.66 | 85.165 | 730.236 |
| 2310.0 | 8.642 | 84.987 | 729.155 |
| 2315.0 | 8.623 | 84.811 | 728.076 |
| 2320.0 | 8.605 | 84.634 | 726.999 |
| 2325.0 | 8.586 | 84.459 | 725.924 |
| 2330.0 | 8.568 | 84.284 | 724.852 |
| 2335.0 | 8.55 | 84.11 | 723.781 |
| 2340.0 | 8.531 | 83.937 | 722.713 |
| 2345.0 | 8.513 | 83.765 | 721.647 |
| 2350.0 | 8.495 | 83.593 | 720.583 |
| 2355.0 | 8.477 | 83.422 | 719.521 |
| 2360.0 | 8.459 | 83.251 | 718.461 |
| 2365.0 | 8.442 | 83.081 | 717.403 |
| 2370.0 | 8.424 | 82.912 | 716.348 |
| 2375.0 | 8.406 | 82.744 | 715.294 |
| 2380.0 | 8.389 | 82.576 | 714.243 |
| 2385.0 | 8.371 | 82.409 | 713.194 |
| 2390.0 | 8.354 | 82.242 | 712.147 |
| 2395.0 | 8.336 | 82.076 | 711.102 |
| 2400.0 | 8.319 | 81.911 | 710.059 |
| 2405.0 | 8.302 | 81.747 | 709.019 |
| 2410.0 | 8.284 | 81.583 | 707.98 |
| 2415.0 | 8.267 | 81.42 | 706.944 |
| 2420.0 | 8.25 | 81.257 | 705.91 |
| 2425.0 | 8.233 | 81.095 | 704.878 |
| 2430.0 | 8.217 | 80.934 | 703.848 |
| 2435.0 | 8.2 | 80.773 | 702.82 |
| 2440.0 | 8.183 | 80.613 | 701.795 |
| 2445.0 | 8.166 | 80.454 | 700.771 |
| 2450.0 | 8.15 | 80.295 | 699.75 |
| 2455.0 | 8.133 | 80.137 | 698.731 |
| 2460.0 | 8.117 | 79.979 | 697.714 |
| 2465.0 | 8.1 | 79.822 | 696.699 |
| 2470.0 | 8.084 | 79.666 | 695.686 |
| 2475.0 | 8.068 | 79.51 | 694.676 |
| 2480.0 | 8.051 | 79.355 | 693.667 |
| 2485.0 | 8.035 | 79.2 | 692.661 |
| 2490.0 | 8.019 | 79.046 | 691.657 |
| 2495.0 | 8.003 | 78.893 | 690.655 |
| 2500.0 | 7.987 | 78.74 | 689.655 |
| 2505.0 | 7.971 | 78.588 | 688.657 |
| 2510.0 | 7.955 | 78.436 | 687.662 |
| 2515.0 | 7.94 | 78.285 | 686.668 |
| 2520.0 | 7.924 | 78.135 | 685.677 |
| 2525.0 | 7.908 | 77.985 | 684.688 |
| 2530.0 | 7.893 | 77.835 | 683.701 |
| 2535.0 | 7.877 | 77.687 | 682.716 |
| 2540.0 | 7.862 | 77.538 | 681.733 |
| 2545.0 | 7.846 | 77.391 | 680.752 |
| 2550.0 | 7.831 | 77.243 | 679.773 |
| 2555.0 | 7.816 | 77.097 | 678.797 |
| 2560.0 | 7.801 | 76.951 | 677.822 |
| 2565.0 | 7.785 | 76.805 | 676.85 |
| 2570.0 | 7.77 | 76.66 | 675.88 |
| 2575.0 | 7.755 | 76.516 | 674.912 |
| 2580.0 | 7.74 | 76.372 | 673.946 |
| 2585.0 | 7.725 | 76.229 | 672.982 |
| 2590.0 | 7.711 | 76.086 | 672.02 |
| 2595.0 | 7.696 | 75.944 | 671.061 |
| 2600.0 | 7.681 | 75.802 | 670.103 |
| 2605.0 | 7.666 | 75.66 | 669.148 |
| 2610.0 | 7.652 | 75.52 | 668.194 |
| 2615.0 | 7.637 | 75.38 | 667.243 |
| 2620.0 | 7.622 | 75.24 | 666.294 |
| 2625.0 | 7.608 | 75.101 | 665.347 |
| 2630.0 | 7.594 | 74.962 | 664.401 |
| 2635.0 | 7.579 | 74.824 | 663.458 |
| 2640.0 | 7.565 | 74.686 | 662.518 |
| 2645.0 | 7.551 | 74.549 | 661.579 |
| 2650.0 | 7.536 | 74.412 | 660.642 |
| 2655.0 | 7.522 | 74.276 | 659.707 |
| 2660.0 | 7.508 | 74.14 | 658.775 |
| 2665.0 | 7.494 | 74.005 | 657.844 |
| 2670.0 | 7.48 | 73.87 | 656.915 |
| 2675.0 | 7.466 | 73.736 | 655.989 |
| 2680.0 | 7.452 | 73.602 | 655.065 |
| 2685.0 | 7.438 | 73.469 | 654.142 |
| 2690.0 | 7.425 | 73.336 | 653.222 |
| 2695.0 | 7.411 | 73.204 | 652.303 |
| 2700.0 | 7.397 | 73.072 | 651.387 |
| 2705.0 | 7.384 | 72.94 | 650.473 |
| 2710.0 | 7.37 | 72.809 | 649.561 |
| 2715.0 | 7.357 | 72.679 | 648.651 |
| 2720.0 | 7.343 | 72.549 | 647.742 |
| 2725.0 | 7.33 | 72.419 | 646.836 |
| 2730.0 | 7.316 | 72.29 | 645.932 |
| 2735.0 | 7.303 | 72.161 | 645.03 |
| 2740.0 | 7.29 | 72.033 | 644.13 |
| 2745.0 | 7.276 | 71.905 | 643.232 |
| 2750.0 | 7.263 | 71.778 | 642.336 |
| 2755.0 | 7.25 | 71.651 | 641.442 |
| 2760.0 | 7.237 | 71.525 | 640.55 |
| 2765.0 | 7.224 | 71.399 | 639.659 |
| 2770.0 | 7.211 | 71.273 | 638.771 |
| 2775.0 | 7.198 | 71.148 | 637.885 |
| 2780.0 | 7.185 | 71.023 | 637.001 |
| 2785.0 | 7.172 | 70.899 | 636.119 |
| 2790.0 | 7.159 | 70.775 | 635.239 |
| 2795.0 | 7.146 | 70.652 | 634.36 |
| 2800.0 | 7.134 | 70.529 | 633.484 |
| 2805.0 | 7.121 | 70.406 | 632.61 |
| 2810.0 | 7.108 | 70.284 | 631.738 |
| 2815.0 | 7.096 | 70.163 | 630.867 |
| 2820.0 | 7.083 | 70.041 | 629.999 |
| 2825.0 | 7.071 | 69.92 | 629.132 |
| 2830.0 | 7.058 | 69.8 | 628.268 |
| 2835.0 | 7.046 | 69.68 | 627.405 |
| 2840.0 | 7.034 | 69.56 | 626.544 |
| 2845.0 | 7.021 | 69.441 | 625.686 |
| 2850.0 | 7.009 | 69.322 | 624.829 |
| 2855.0 | 6.997 | 69.204 | 623.974 |
| 2860.0 | 6.984 | 69.085 | 623.121 |
| 2865.0 | 6.972 | 68.968 | 622.27 |
| 2870.0 | 6.96 | 68.851 | 621.421 |
| 2875.0 | 6.948 | 68.734 | 620.573 |
| 2880.0 | 6.936 | 68.617 | 619.728 |
| 2885.0 | 6.924 | 68.501 | 618.885 |
| 2890.0 | 6.912 | 68.385 | 618.043 |
| 2895.0 | 6.9 | 68.27 | 617.203 |
| 2900.0 | 6.888 | 68.155 | 616.366 |
| 2905.0 | 6.877 | 68.041 | 615.53 |
| 2910.0 | 6.865 | 67.926 | 614.696 |
| 2915.0 | 6.853 | 67.813 | 613.864 |
| 2920.0 | 6.841 | 67.699 | 613.033 |
| 2925.0 | 6.83 | 67.586 | 612.205 |
| 2930.0 | 6.818 | 67.473 | 611.378 |
| 2935.0 | 6.806 | 67.361 | 610.554 |
| 2940.0 | 6.795 | 67.249 | 609.731 |
| 2945.0 | 6.783 | 67.138 | 608.91 |
| 2950.0 | 6.772 | 67.026 | 608.091 |
| 2955.0 | 6.76 | 66.916 | 607.273 |
| 2960.0 | 6.749 | 66.805 | 606.458 |
| 2965.0 | 6.738 | 66.695 | 605.644 |
| 2970.0 | 6.726 | 66.585 | 604.833 |
| 2975.0 | 6.715 | 66.476 | 604.023 |
| 2980.0 | 6.704 | 66.367 | 603.214 |
| 2985.0 | 6.693 | 66.258 | 602.408 |
| 2990.0 | 6.681 | 66.15 | 601.604 |
| 2995.0 | 6.67 | 66.042 | 600.801 |
| 3000.0 | 6.659 | 65.934 | 600 |
| 3005.0 | 6.648 | 65.827 | 599.201 |
| 3010.0 | 6.637 | 65.72 | 598.404 |
| 3015.0 | 6.626 | 65.613 | 597.608 |
| 3020.0 | 6.615 | 65.507 | 596.814 |
| 3025.0 | 6.604 | 65.401 | 596.022 |
| 3030.0 | 6.593 | 65.295 | 595.232 |
| 3035.0 | 6.583 | 65.19 | 594.444 |
| 3040.0 | 6.572 | 65.085 | 593.657 |
| 3045.0 | 6.561 | 64.981 | 592.872 |
| 3050.0 | 6.55 | 64.876 | 592.089 |
| 3055.0 | 6.54 | 64.772 | 591.308 |
| 3060.0 | 6.529 | 64.669 | 590.528 |
| 3065.0 | 6.518 | 64.566 | 589.751 |
| 3070.0 | 6.508 | 64.463 | 588.974 |
| 3075.0 | 6.497 | 64.36 | 588.2 |
| 3080.0 | 6.487 | 64.258 | 587.428 |
| 3085.0 | 6.476 | 64.156 | 586.657 |
| 3090.0 | 6.466 | 64.054 | 585.888 |
| 3095.0 | 6.455 | 63.953 | 585.12 |
| 3100.0 | 6.445 | 63.852 | 584.354 |
| 3105.0 | 6.435 | 63.751 | 583.59 |
| 3110.0 | 6.424 | 63.651 | 582.828 |
| 3115.0 | 6.414 | 63.551 | 582.068 |
| 3120.0 | 6.404 | 63.451 | 581.309 |
| 3125.0 | 6.393 | 63.351 | 580.552 |
| 3130.0 | 6.383 | 63.252 | 579.796 |
| 3135.0 | 6.373 | 63.153 | 579.042 |
| 3140.0 | 6.363 | 63.055 | 578.29 |
| 3145.0 | 6.353 | 62.957 | 577.54 |
| 3150.0 | 6.343 | 62.859 | 576.791 |
| 3155.0 | 6.333 | 62.761 | 576.044 |
| 3160.0 | 6.323 | 62.664 | 575.299 |
| 3165.0 | 6.313 | 62.567 | 574.555 |
| 3170.0 | 6.303 | 62.47 | 573.813 |
| 3175.0 | 6.293 | 62.373 | 573.072 |
| 3180.0 | 6.283 | 62.277 | 572.334 |
| 3185.0 | 6.273 | 62.181 | 571.596 |
| 3190.0 | 6.263 | 62.086 | 570.861 |
| 3195.0 | 6.254 | 61.991 | 570.127 |
| 3200.0 | 6.244 | 61.896 | 569.395 |
| 3205.0 | 6.234 | 61.801 | 568.664 |
| 3210.0 | 6.224 | 61.706 | 567.936 |
| 3215.0 | 6.215 | 61.612 | 567.208 |
| 3220.0 | 6.205 | 61.518 | 566.483 |
| 3225.0 | 6.196 | 61.425 | 565.758 |
| 3230.0 | 6.186 | 61.332 | 565.036 |
| 3235.0 | 6.176 | 61.239 | 564.315 |
| 3240.0 | 6.167 | 61.146 | 563.596 |
| 3245.0 | 6.157 | 61.053 | 562.878 |
| 3250.0 | 6.148 | 60.961 | 562.162 |
| 3255.0 | 6.139 | 60.869 | 561.448 |
| 3260.0 | 6.129 | 60.778 | 560.735 |
| 3265.0 | 6.12 | 60.686 | 560.023 |
| 3270.0 | 6.11 | 60.595 | 559.314 |
| 3275.0 | 6.101 | 60.505 | 558.606 |
| 3280.0 | 6.092 | 60.414 | 557.899 |
| 3285.0 | 6.083 | 60.324 | 557.194 |
| 3290.0 | 6.073 | 60.234 | 556.491 |
| 3295.0 | 6.064 | 60.144 | 555.789 |
| 3300.0 | 6.055 | 60.055 | 555.088 |
| 3305.0 | 6.046 | 59.965 | 554.39 |
| 3310.0 | 6.037 | 59.876 | 553.692 |
| 3315.0 | 6.028 | 59.788 | 552.997 |
| 3320.0 | 6.019 | 59.699 | 552.302 |
| 3325.0 | 6.01 | 59.611 | 551.61 |
| 3330.0 | 6.001 | 59.523 | 550.919 |
| 3335.0 | 5.992 | 59.436 | 550.229 |
| 3340.0 | 5.983 | 59.348 | 549.541 |
| 3345.0 | 5.974 | 59.261 | 548.854 |
| 3350.0 | 5.965 | 59.174 | 548.169 |
| 3355.0 | 5.956 | 59.088 | 547.486 |
| 3360.0 | 5.947 | 59.001 | 546.804 |
| 3365.0 | 5.938 | 58.915 | 546.123 |
| 3370.0 | 5.929 | 58.829 | 545.444 |
| 3375.0 | 5.921 | 58.744 | 544.767 |
| 3380.0 | 5.912 | 58.658 | 544.091 |
| 3385.0 | 5.903 | 58.573 | 543.416 |
| 3390.0 | 5.895 | 58.488 | 542.743 |
| 3395.0 | 5.886 | 58.403 | 542.071 |
| 3400.0 | 5.877 | 58.319 | 541.401 |
| 3405.0 | 5.869 | 58.235 | 540.733 |
| 3410.0 | 5.86 | 58.151 | 540.065 |
| 3415.0 | 5.851 | 58.067 | 539.4 |
| 3420.0 | 5.843 | 57.984 | 538.735 |
| 3425.0 | 5.834 | 57.901 | 538.073 |
| 3430.0 | 5.826 | 57.818 | 537.411 |
| 3435.0 | 5.817 | 57.735 | 536.751 |
| 3440.0 | 5.809 | 57.652 | 536.093 |
| 3445.0 | 5.801 | 57.57 | 535.436 |
| 3450.0 | 5.792 | 57.488 | 534.78 |
| 3455.0 | 5.784 | 57.406 | 534.126 |
| 3460.0 | 5.776 | 57.325 | 533.473 |
| 3465.0 | 5.767 | 57.243 | 532.822 |
| 3470.0 | 5.759 | 57.162 | 532.172 |
| 3475.0 | 5.751 | 57.081 | 531.523 |
| 3480.0 | 5.742 | 57.001 | 530.876 |
| 3485.0 | 5.734 | 56.92 | 530.231 |
| 3490.0 | 5.726 | 56.84 | 529.586 |
| 3495.0 | 5.718 | 56.76 | 528.943 |
| 3500.0 | 5.71 | 56.68 | 528.302 |
| 3505.0 | 5.701 | 56.601 | 527.662 |
| 3510.0 | 5.693 | 56.521 | 527.023 |
| 3515.0 | 5.685 | 56.442 | 526.386 |
| 3520.0 | 5.677 | 56.363 | 525.75 |
| 3525.0 | 5.669 | 56.285 | 525.115 |
| 3530.0 | 5.661 | 56.206 | 524.482 |
| 3535.0 | 5.653 | 56.128 | 523.85 |
| 3540.0 | 5.645 | 56.05 | 523.22 |
| 3545.0 | 5.637 | 55.972 | 522.591 |
| 3550.0 | 5.629 | 55.895 | 521.963 |
| 3555.0 | 5.621 | 55.817 | 521.336 |
| 3560.0 | 5.614 | 55.74 | 520.711 |
| 3565.0 | 5.606 | 55.663 | 520.088 |
| 3570.0 | 5.598 | 55.586 | 519.465 |
| 3575.0 | 5.59 | 55.51 | 518.844 |
| 3580.0 | 5.582 | 55.433 | 518.225 |
| 3585.0 | 5.574 | 55.357 | 517.606 |
| 3590.0 | 5.567 | 55.281 | 516.989 |
| 3595.0 | 5.559 | 55.206 | 516.374 |
| 3600.0 | 5.551 | 55.13 | 515.759 |
| 3605.0 | 5.544 | 55.055 | 515.146 |
| 3610.0 | 5.536 | 54.98 | 514.535 |
| 3615.0 | 5.528 | 54.905 | 513.924 |
| 3620.0 | 5.521 | 54.83 | 513.315 |
| 3625.0 | 5.513 | 54.756 | 512.707 |
| 3630.0 | 5.505 | 54.681 | 512.101 |
| 3635.0 | 5.498 | 54.607 | 511.495 |
| 3640.0 | 5.49 | 54.533 | 510.892 |
| 3645.0 | 5.483 | 54.46 | 510.289 |
| 3650.0 | 5.475 | 54.386 | 509.688 |
| 3655.0 | 5.468 | 54.313 | 509.087 |
| 3660.0 | 5.46 | 54.24 | 508.489 |
| 3665.0 | 5.453 | 54.167 | 507.891 |
| 3670.0 | 5.446 | 54.094 | 507.295 |
| 3675.0 | 5.438 | 54.022 | 506.7 |
| 3680.0 | 5.431 | 53.949 | 506.106 |
| 3685.0 | 5.423 | 53.877 | 505.514 |
| 3690.0 | 5.416 | 53.805 | 504.923 |
| 3695.0 | 5.409 | 53.734 | 504.333 |
| 3700.0 | 5.401 | 53.662 | 503.744 |
| 3705.0 | 5.394 | 53.591 | 503.157 |
| 3710.0 | 5.387 | 53.52 | 502.57 |
| 3715.0 | 5.38 | 53.449 | 501.985 |
| 3720.0 | 5.372 | 53.378 | 501.402 |
| 3725.0 | 5.365 | 53.307 | 500.819 |
| 3730.0 | 5.358 | 53.237 | 500.238 |
| 3735.0 | 5.351 | 53.166 | 499.658 |
| 3740.0 | 5.344 | 53.096 | 499.079 |
| 3745.0 | 5.337 | 53.026 | 498.502 |
| 3750.0 | 5.33 | 52.957 | 497.925 |
| 3755.0 | 5.322 | 52.887 | 497.35 |
| 3760.0 | 5.315 | 52.818 | 496.776 |
| 3765.0 | 5.308 | 52.749 | 496.204 |
| 3770.0 | 5.301 | 52.68 | 495.632 |
| 3775.0 | 5.294 | 52.611 | 495.062 |
| 3780.0 | 5.287 | 52.542 | 494.493 |
| 3785.0 | 5.28 | 52.474 | 493.925 |
| 3790.0 | 5.273 | 52.406 | 493.358 |
| 3795.0 | 5.266 | 52.338 | 492.792 |
| 3800.0 | 5.26 | 52.27 | 492.228 |
| 3805.0 | 5.253 | 52.202 | 491.665 |
| 3810.0 | 5.246 | 52.134 | 491.103 |
| 3815.0 | 5.239 | 52.067 | 490.542 |
| 3820.0 | 5.232 | 52 | 489.982 |
| 3825.0 | 5.225 | 51.933 | 489.424 |
| 3830.0 | 5.218 | 51.866 | 488.866 |
| 3835.0 | 5.212 | 51.799 | 488.31 |
| 3840.0 | 5.205 | 51.732 | 487.755 |
| 3845.0 | 5.198 | 51.666 | 487.201 |
| 3850.0 | 5.191 | 51.6 | 486.649 |
| 3855.0 | 5.185 | 51.534 | 486.097 |
| 3860.0 | 5.178 | 51.468 | 485.547 |
| 3865.0 | 5.171 | 51.402 | 484.998 |
| 3870.0 | 5.165 | 51.337 | 484.449 |
| 3875.0 | 5.158 | 51.271 | 483.902 |
| 3880.0 | 5.151 | 51.206 | 483.357 |
| 3885.0 | 5.145 | 51.141 | 482.812 |
| 3890.0 | 5.138 | 51.076 | 482.268 |
| 3895.0 | 5.131 | 51.012 | 481.726 |
| 3900.0 | 5.125 | 50.947 | 481.184 |
| 3905.0 | 5.118 | 50.883 | 480.644 |
| 3910.0 | 5.112 | 50.818 | 480.105 |
| 3915.0 | 5.105 | 50.754 | 479.567 |
| 3920.0 | 5.099 | 50.691 | 479.03 |
| 3925.0 | 5.092 | 50.627 | 478.494 |
| 3930.0 | 5.086 | 50.563 | 477.96 |
| 3935.0 | 5.079 | 50.5 | 477.426 |
| 3940.0 | 5.073 | 50.437 | 476.894 |
| 3945.0 | 5.066 | 50.373 | 476.362 |
| 3950.0 | 5.06 | 50.31 | 475.832 |
| 3955.0 | 5.054 | 50.248 | 475.303 |
| 3960.0 | 5.047 | 50.185 | 474.775 |
| 3965.0 | 5.041 | 50.123 | 474.248 |
| 3970.0 | 5.035 | 50.06 | 473.722 |
| 3975.0 | 5.028 | 49.998 | 473.197 |
| 3980.0 | 5.022 | 49.936 | 472.673 |
| 3985.0 | 5.016 | 49.874 | 472.15 |
| 3990.0 | 5.009 | 49.812 | 471.628 |
| 3995.0 | 5.003 | 49.751 | 471.108 |
| 4000.0 | 4.997 | 49.689 | 470.588 |
| 4005.0 | 4.991 | 49.628 | 470.07 |
| 4010.0 | 4.984 | 49.567 | 469.552 |
| 4015.0 | 4.978 | 49.506 | 469.036 |
| 4020.0 | 4.972 | 49.445 | 468.521 |
| 4025.0 | 4.966 | 49.385 | 468.006 |
| 4030.0 | 4.96 | 49.324 | 467.493 |
| 4035.0 | 4.954 | 49.264 | 466.981 |
| 4040.0 | 4.947 | 49.203 | 466.47 |
| 4045.0 | 4.941 | 49.143 | 465.959 |
| 4050.0 | 4.935 | 49.083 | 465.45 |
| 4055.0 | 4.929 | 49.024 | 464.942 |
| 4060.0 | 4.923 | 48.964 | 464.435 |
| 4065.0 | 4.917 | 48.905 | 463.929 |
| 4070.0 | 4.911 | 48.845 | 463.424 |
| 4075.0 | 4.905 | 48.786 | 462.92 |
| 4080.0 | 4.899 | 48.727 | 462.417 |
| 4085.0 | 4.893 | 48.668 | 461.915 |
| 4090.0 | 4.887 | 48.609 | 461.414 |
| 4095.0 | 4.881 | 48.551 | 460.914 |
| 4100.0 | 4.875 | 48.492 | 460.415 |
| 4105.0 | 4.869 | 48.434 | 459.918 |
| 4110.0 | 4.863 | 48.375 | 459.421 |
| 4115.0 | 4.857 | 48.317 | 458.925 |
| 4120.0 | 4.852 | 48.259 | 458.43 |
| 4125.0 | 4.846 | 48.202 | 457.936 |
| 4130.0 | 4.84 | 48.144 | 457.443 |
| 4135.0 | 4.834 | 48.086 | 456.951 |
| 4140.0 | 4.828 | 48.029 | 456.46 |
| 4145.0 | 4.822 | 47.972 | 455.97 |
| 4150.0 | 4.816 | 47.915 | 455.481 |
| 4155.0 | 4.811 | 47.858 | 454.993 |
| 4160.0 | 4.805 | 47.801 | 454.506 |
| 4165.0 | 4.799 | 47.744 | 454.02 |
| 4170.0 | 4.793 | 47.687 | 453.534 |
| 4175.0 | 4.788 | 47.631 | 453.05 |
| 4180.0 | 4.782 | 47.575 | 452.567 |
| 4185.0 | 4.776 | 47.518 | 452.085 |
| 4190.0 | 4.771 | 47.462 | 451.604 |
| 4195.0 | 4.765 | 47.406 | 451.123 |
| 4200.0 | 4.759 | 47.351 | 450.644 |
| 4205.0 | 4.754 | 47.295 | 450.165 |
| 4210.0 | 4.748 | 47.239 | 449.688 |
| 4215.0 | 4.742 | 47.184 | 449.211 |
| 4220.0 | 4.737 | 47.129 | 448.736 |
| 4225.0 | 4.731 | 47.074 | 448.261 |
| 4230.0 | 4.725 | 47.019 | 447.787 |
| 4235.0 | 4.72 | 46.964 | 447.314 |
| 4240.0 | 4.714 | 46.909 | 446.843 |
| 4245.0 | 4.709 | 46.854 | 446.372 |
| 4250.0 | 4.703 | 46.8 | 445.902 |
| 4255.0 | 4.698 | 46.745 | 445.433 |
| 4260.0 | 4.692 | 46.691 | 444.964 |
| 4265.0 | 4.687 | 46.637 | 444.497 |
| 4270.0 | 4.681 | 46.583 | 444.031 |
| 4275.0 | 4.676 | 46.529 | 443.565 |
| 4280.0 | 4.67 | 46.475 | 443.101 |
| 4285.0 | 4.665 | 46.422 | 442.637 |
| 4290.0 | 4.659 | 46.368 | 442.175 |
| 4295.0 | 4.654 | 46.315 | 441.713 |
| 4300.0 | 4.649 | 46.261 | 441.252 |
| 4305.0 | 4.643 | 46.208 | 440.792 |
| 4310.0 | 4.638 | 46.155 | 440.333 |
| 4315.0 | 4.633 | 46.102 | 439.875 |
| 4320.0 | 4.627 | 46.05 | 439.417 |
| 4325.0 | 4.622 | 45.997 | 438.961 |
| 4330.0 | 4.616 | 45.944 | 438.505 |
| 4335.0 | 4.611 | 45.892 | 438.051 |
| 4340.0 | 4.606 | 45.84 | 437.597 |
| 4345.0 | 4.601 | 45.787 | 437.144 |
| 4350.0 | 4.595 | 45.735 | 436.692 |
| 4355.0 | 4.59 | 45.683 | 436.241 |
| 4360.0 | 4.585 | 45.632 | 435.791 |
| 4365.0 | 4.579 | 45.58 | 435.341 |
| 4370.0 | 4.574 | 45.528 | 434.893 |
| 4375.0 | 4.569 | 45.477 | 434.445 |
| 4380.0 | 4.564 | 45.425 | 433.999 |
| 4385.0 | 4.559 | 45.374 | 433.553 |
| 4390.0 | 4.553 | 45.323 | 433.108 |
| 4395.0 | 4.548 | 45.272 | 432.663 |
| 4400.0 | 4.543 | 45.221 | 432.22 |
| 4405.0 | 4.538 | 45.17 | 431.778 |
| 4410.0 | 4.533 | 45.119 | 431.336 |
| 4415.0 | 4.528 | 45.069 | 430.895 |
| 4420.0 | 4.523 | 45.018 | 430.455 |
| 4425.0 | 4.517 | 44.968 | 430.016 |
| 4430.0 | 4.512 | 44.918 | 429.578 |
| 4435.0 | 4.507 | 44.868 | 429.14 |
| 4440.0 | 4.502 | 44.818 | 428.704 |
| 4445.0 | 4.497 | 44.768 | 428.268 |
| 4450.0 | 4.492 | 44.718 | 427.833 |
| 4455.0 | 4.487 | 44.668 | 427.399 |
| 4460.0 | 4.482 | 44.619 | 426.966 |
| 4465.0 | 4.477 | 44.569 | 426.533 |
| 4470.0 | 4.472 | 44.52 | 426.102 |
| 4475.0 | 4.467 | 44.471 | 425.671 |
| 4480.0 | 4.462 | 44.422 | 425.241 |
| 4485.0 | 4.457 | 44.372 | 424.812 |
| 4490.0 | 4.452 | 44.324 | 424.384 |
| 4495.0 | 4.447 | 44.275 | 423.956 |
| 4500.0 | 4.442 | 44.226 | 423.529 |
| 4505.0 | 4.437 | 44.177 | 423.104 |
| 4510.0 | 4.432 | 44.129 | 422.678 |
| 4515.0 | 4.428 | 44.081 | 422.254 |
| 4520.0 | 4.423 | 44.032 | 421.831 |
| 4525.0 | 4.418 | 43.984 | 421.408 |
| 4530.0 | 4.413 | 43.936 | 420.986 |
| 4535.0 | 4.408 | 43.888 | 420.565 |
| 4540.0 | 4.403 | 43.84 | 420.145 |
| 4545.0 | 4.398 | 43.792 | 419.725 |
| 4550.0 | 4.393 | 43.745 | 419.307 |
| 4555.0 | 4.389 | 43.697 | 418.889 |
| 4560.0 | 4.384 | 43.65 | 418.471 |
| 4565.0 | 4.379 | 43.602 | 418.055 |
| 4570.0 | 4.374 | 43.555 | 417.64 |
| 4575.0 | 4.369 | 43.508 | 417.225 |
| 4580.0 | 4.365 | 43.461 | 416.811 |
| 4585.0 | 4.36 | 43.414 | 416.398 |
| 4590.0 | 4.355 | 43.367 | 415.985 |
| 4595.0 | 4.35 | 43.32 | 415.573 |
| 4600.0 | 4.346 | 43.274 | 415.162 |
| 4605.0 | 4.341 | 43.227 | 414.752 |
| 4610.0 | 4.336 | 43.181 | 414.343 |
| 4615.0 | 4.332 | 43.134 | 413.934 |
| 4620.0 | 4.327 | 43.088 | 413.526 |
| 4625.0 | 4.322 | 43.042 | 413.119 |
| 4630.0 | 4.318 | 42.996 | 412.713 |
| 4635.0 | 4.313 | 42.95 | 412.307 |
| 4640.0 | 4.308 | 42.904 | 411.903 |
| 4645.0 | 4.304 | 42.858 | 411.498 |
| 4650.0 | 4.299 | 42.813 | 411.095 |
| 4655.0 | 4.294 | 42.767 | 410.693 |
| 4660.0 | 4.29 | 42.722 | 410.291 |
| 4665.0 | 4.285 | 42.676 | 409.89 |
| 4670.0 | 4.281 | 42.631 | 409.489 |
| 4675.0 | 4.276 | 42.586 | 409.09 |
| 4680.0 | 4.272 | 42.541 | 408.691 |
| 4685.0 | 4.267 | 42.496 | 408.293 |
| 4690.0 | 4.262 | 42.451 | 407.895 |
| 4695.0 | 4.258 | 42.406 | 407.499 |
| 4700.0 | 4.253 | 42.361 | 407.103 |
| 4705.0 | 4.249 | 42.317 | 406.707 |
| 4710.0 | 4.244 | 42.272 | 406.313 |
| 4715.0 | 4.24 | 42.228 | 405.919 |
| 4720.0 | 4.235 | 42.184 | 405.526 |
| 4725.0 | 4.231 | 42.139 | 405.134 |
| 4730.0 | 4.226 | 42.095 | 404.742 |
| 4735.0 | 4.222 | 42.051 | 404.351 |
| 4740.0 | 4.218 | 42.007 | 403.961 |
| 4745.0 | 4.213 | 41.963 | 403.572 |
| 4750.0 | 4.209 | 41.919 | 403.183 |
| 4755.0 | 4.204 | 41.876 | 402.795 |
| 4760.0 | 4.2 | 41.832 | 402.408 |
| 4765.0 | 4.195 | 41.789 | 402.021 |
| 4770.0 | 4.191 | 41.745 | 401.635 |
| 4775.0 | 4.187 | 41.702 | 401.25 |
| 4780.0 | 4.182 | 41.659 | 400.865 |
| 4785.0 | 4.178 | 41.616 | 400.482 |
| 4790.0 | 4.174 | 41.572 | 400.099 |
| 4795.0 | 4.169 | 41.529 | 399.716 |
| 4800.0 | 4.165 | 41.487 | 399.334 |
| 4805.0 | 4.161 | 41.444 | 398.953 |
| 4810.0 | 4.156 | 41.401 | 398.573 |
| 4815.0 | 4.152 | 41.358 | 398.193 |
| 4820.0 | 4.148 | 41.316 | 397.814 |
| 4825.0 | 4.143 | 41.273 | 397.436 |
| 4830.0 | 4.139 | 41.231 | 397.059 |
| 4835.0 | 4.135 | 41.189 | 396.682 |
| 4840.0 | 4.13 | 41.147 | 396.306 |
| 4845.0 | 4.126 | 41.105 | 395.93 |
| 4850.0 | 4.122 | 41.063 | 395.555 |
| 4855.0 | 4.118 | 41.021 | 395.181 |
| 4860.0 | 4.113 | 40.979 | 394.807 |
| 4865.0 | 4.109 | 40.937 | 394.435 |
| 4870.0 | 4.105 | 40.895 | 394.062 |
| 4875.0 | 4.101 | 40.854 | 393.691 |
| 4880.0 | 4.097 | 40.812 | 393.32 |
| 4885.0 | 4.092 | 40.771 | 392.95 |
| 4890.0 | 4.088 | 40.729 | 392.58 |
| 4895.0 | 4.084 | 40.688 | 392.211 |
| 4900.0 | 4.08 | 40.647 | 391.843 |
| 4905.0 | 4.076 | 40.606 | 391.476 |
| 4910.0 | 4.072 | 40.565 | 391.109 |
| 4915.0 | 4.067 | 40.524 | 390.743 |
| 4920.0 | 4.063 | 40.483 | 390.377 |
| 4925.0 | 4.059 | 40.442 | 390.012 |
| 4930.0 | 4.055 | 40.402 | 389.648 |
| 4935.0 | 4.051 | 40.361 | 389.284 |
| 4940.0 | 4.047 | 40.321 | 388.921 |
| 4945.0 | 4.043 | 40.28 | 388.559 |
| 4950.0 | 4.039 | 40.24 | 388.197 |
| 4955.0 | 4.035 | 40.2 | 387.836 |
| 4960.0 | 4.031 | 40.159 | 387.476 |
| 4965.0 | 4.027 | 40.119 | 387.116 |
| 4970.0 | 4.023 | 40.079 | 386.757 |
| 4975.0 | 4.018 | 40.039 | 386.398 |
| 4980.0 | 4.014 | 39.999 | 386.041 |
| 4985.0 | 4.01 | 39.96 | 385.683 |
| 4990.0 | 4.006 | 39.92 | 385.327 |
| 4995.0 | 4.002 | 39.88 | 384.971 |
| 5000.0 | 3.998 | 39.841 | 384.615 |